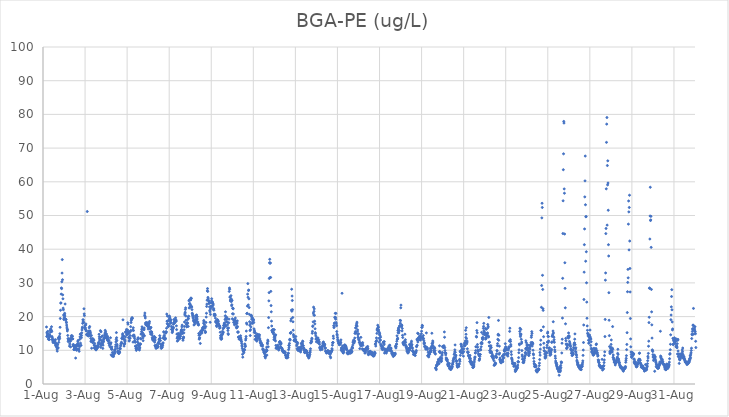
| Category | BGA-PE (ug/L) |
|---|---|
| 44774.166666666664 | 16.92 |
| 44774.177083333336 | 14.11 |
| 44774.1875 | 15.34 |
| 44774.197916666664 | 15.07 |
| 44774.208333333336 | 14.6 |
| 44774.21875 | 14.33 |
| 44774.229166666664 | 15.63 |
| 44774.239583333336 | 14.88 |
| 44774.25 | 13.34 |
| 44774.260416666664 | 14.18 |
| 44774.270833333336 | 13.73 |
| 44774.28125 | 13.21 |
| 44774.291666666664 | 13.82 |
| 44774.302083333336 | 13.18 |
| 44774.3125 | 14.64 |
| 44774.322916666664 | 14.43 |
| 44774.333333333336 | 14.18 |
| 44774.34375 | 15.96 |
| 44774.354166666664 | 15.36 |
| 44774.364583333336 | 16.37 |
| 44774.375 | 15.71 |
| 44774.385416666664 | 15.97 |
| 44774.395833333336 | 15.94 |
| 44774.40625 | 17 |
| 44774.416666666664 | 15.57 |
| 44774.427083333336 | 14.09 |
| 44774.4375 | 13.16 |
| 44774.447916666664 | 13.66 |
| 44774.458333333336 | 13.26 |
| 44774.46875 | 12.71 |
| 44774.479166666664 | 12.29 |
| 44774.489583333336 | 12.75 |
| 44774.5 | 12.56 |
| 44774.510416666664 | 12.51 |
| 44774.520833333336 | 12.77 |
| 44774.53125 | 13.04 |
| 44774.541666666664 | 12.8 |
| 44774.552083333336 | 12.38 |
| 44774.5625 | 12.25 |
| 44774.572916666664 | 12.52 |
| 44774.583333333336 | 11.94 |
| 44774.59375 | 13.15 |
| 44774.604166666664 | 11.35 |
| 44774.614583333336 | 11.45 |
| 44774.625 | 11.86 |
| 44774.635416666664 | 12 |
| 44774.645833333336 | 11.11 |
| 44774.65625 | 10.83 |
| 44774.666666666664 | 10.36 |
| 44774.677083333336 | 9.75 |
| 44774.6875 | 11.79 |
| 44774.697916666664 | 11.64 |
| 44774.708333333336 | 10.62 |
| 44774.71875 | 10.79 |
| 44774.729166666664 | 13.51 |
| 44774.739583333336 | 13.8 |
| 44774.75 | 12.36 |
| 44774.760416666664 | 13.16 |
| 44774.770833333336 | 13.83 |
| 44774.78125 | 14.16 |
| 44774.791666666664 | 13.52 |
| 44774.802083333336 | 14.91 |
| 44774.8125 | 16.83 |
| 44774.822916666664 | 19.44 |
| 44774.833333333336 | 21.88 |
| 44774.84375 | 23.99 |
| 44774.854166666664 | 24.07 |
| 44774.864583333336 | 26.68 |
| 44774.875 | 28.51 |
| 44774.885416666664 | 28.3 |
| 44774.895833333336 | 30.33 |
| 44774.90625 | 32.92 |
| 44774.916666666664 | 36.91 |
| 44774.927083333336 | 30.95 |
| 44774.9375 | 26.45 |
| 44774.947916666664 | 25.28 |
| 44774.958333333336 | 22.51 |
| 44774.96875 | 22.03 |
| 44774.979166666664 | 20.46 |
| 44774.989583333336 | 19.29 |
| 44775.0 | 19.12 |
| 44775.010416666664 | 19.81 |
| 44775.020833333336 | 20.59 |
| 44775.03125 | 20.98 |
| 44775.041666666664 | 20.17 |
| 44775.052083333336 | 23.74 |
| 44775.0625 | 19.3 |
| 44775.072916666664 | 19.22 |
| 44775.083333333336 | 19.19 |
| 44775.09375 | 19.11 |
| 44775.104166666664 | 18.42 |
| 44775.114583333336 | 18.18 |
| 44775.125 | 17.49 |
| 44775.135416666664 | 16.89 |
| 44775.145833333336 | 16.38 |
| 44775.15625 | 15.73 |
| 44775.166666666664 | 16.12 |
| 44775.177083333336 | 14.41 |
| 44775.1875 | 13.46 |
| 44775.197916666664 | 12.59 |
| 44775.208333333336 | 13.03 |
| 44775.21875 | 13.15 |
| 44775.229166666664 | 13.46 |
| 44775.239583333336 | 13.25 |
| 44775.25 | 12.78 |
| 44775.260416666664 | 11.24 |
| 44775.270833333336 | 11.89 |
| 44775.28125 | 13.18 |
| 44775.291666666664 | 12.65 |
| 44775.302083333336 | 12.76 |
| 44775.3125 | 11.02 |
| 44775.322916666664 | 13.22 |
| 44775.333333333336 | 13.66 |
| 44775.34375 | 13.33 |
| 44775.354166666664 | 14.35 |
| 44775.364583333336 | 14.08 |
| 44775.375 | 14.29 |
| 44775.385416666664 | 14.22 |
| 44775.395833333336 | 14.11 |
| 44775.40625 | 13.4 |
| 44775.416666666664 | 13.39 |
| 44775.427083333336 | 11.64 |
| 44775.4375 | 11.31 |
| 44775.447916666664 | 11.7 |
| 44775.458333333336 | 11.24 |
| 44775.46875 | 10.25 |
| 44775.479166666664 | 10.18 |
| 44775.489583333336 | 10.69 |
| 44775.5 | 10.59 |
| 44775.510416666664 | 10.52 |
| 44775.520833333336 | 10.27 |
| 44775.53125 | 11.35 |
| 44775.541666666664 | 11.26 |
| 44775.552083333336 | 7.7 |
| 44775.5625 | 10.57 |
| 44775.572916666664 | 11.12 |
| 44775.583333333336 | 11.51 |
| 44775.59375 | 10.02 |
| 44775.604166666664 | 10.26 |
| 44775.614583333336 | 10.48 |
| 44775.625 | 11.38 |
| 44775.635416666664 | 11.87 |
| 44775.645833333336 | 11.58 |
| 44775.65625 | 12.53 |
| 44775.666666666664 | 12.92 |
| 44775.677083333336 | 11.87 |
| 44775.6875 | 11.37 |
| 44775.697916666664 | 10.15 |
| 44775.708333333336 | 10.4 |
| 44775.71875 | 9.7 |
| 44775.729166666664 | 11.43 |
| 44775.739583333336 | 11.06 |
| 44775.75 | 13.26 |
| 44775.760416666664 | 13.99 |
| 44775.770833333336 | 14.8 |
| 44775.78125 | 12.13 |
| 44775.791666666664 | 14.78 |
| 44775.802083333336 | 13.88 |
| 44775.8125 | 11.47 |
| 44775.822916666664 | 13.72 |
| 44775.833333333336 | 14.38 |
| 44775.84375 | 15.18 |
| 44775.854166666664 | 16.04 |
| 44775.864583333336 | 16.59 |
| 44775.875 | 16.87 |
| 44775.885416666664 | 17.99 |
| 44775.895833333336 | 19.05 |
| 44775.90625 | 18.41 |
| 44775.916666666664 | 19.02 |
| 44775.927083333336 | 18.27 |
| 44775.9375 | 18.24 |
| 44775.947916666664 | 22.32 |
| 44775.958333333336 | 20.81 |
| 44775.96875 | 20.28 |
| 44775.979166666664 | 16.71 |
| 44775.989583333336 | 17.27 |
| 44776.0 | 16.37 |
| 44776.010416666664 | 16.76 |
| 44776.020833333336 | 17.44 |
| 44776.03125 | 16.22 |
| 44776.041666666664 | 17.82 |
| 44776.052083333336 | 15.79 |
| 44776.0625 | 15.76 |
| 44776.072916666664 | 14.7 |
| 44776.083333333336 | 14.71 |
| 44776.09375 | 14.5 |
| 44776.104166666664 | 51.18 |
| 44776.114583333336 | 14.47 |
| 44776.125 | 14.93 |
| 44776.135416666664 | 14.73 |
| 44776.145833333336 | 14.53 |
| 44776.15625 | 14.23 |
| 44776.166666666664 | 15.32 |
| 44776.177083333336 | 15.71 |
| 44776.1875 | 15.62 |
| 44776.197916666664 | 16.68 |
| 44776.208333333336 | 14.77 |
| 44776.21875 | 17.06 |
| 44776.229166666664 | 15.73 |
| 44776.239583333336 | 15.65 |
| 44776.25 | 14.25 |
| 44776.260416666664 | 15.14 |
| 44776.270833333336 | 13.56 |
| 44776.28125 | 12.61 |
| 44776.291666666664 | 12.78 |
| 44776.302083333336 | 14.4 |
| 44776.3125 | 10.61 |
| 44776.322916666664 | 13.12 |
| 44776.333333333336 | 13.19 |
| 44776.34375 | 12.85 |
| 44776.354166666664 | 12.32 |
| 44776.364583333336 | 13.48 |
| 44776.375 | 12.39 |
| 44776.385416666664 | 12.93 |
| 44776.395833333336 | 12.88 |
| 44776.40625 | 13.18 |
| 44776.416666666664 | 12.95 |
| 44776.427083333336 | 11.57 |
| 44776.4375 | 10.69 |
| 44776.447916666664 | 11.45 |
| 44776.458333333336 | 12.03 |
| 44776.46875 | 10.72 |
| 44776.479166666664 | 11.21 |
| 44776.489583333336 | 10.38 |
| 44776.5 | 10.76 |
| 44776.510416666664 | 10.65 |
| 44776.520833333336 | 10.11 |
| 44776.53125 | 10.23 |
| 44776.541666666664 | 11.05 |
| 44776.552083333336 | 10.57 |
| 44776.5625 | 10.5 |
| 44776.572916666664 | 10.97 |
| 44776.583333333336 | 11.18 |
| 44776.59375 | 10.75 |
| 44776.604166666664 | 11.52 |
| 44776.614583333336 | 11.17 |
| 44776.625 | 11.19 |
| 44776.635416666664 | 12.31 |
| 44776.645833333336 | 12.11 |
| 44776.65625 | 12.01 |
| 44776.666666666664 | 14.75 |
| 44776.677083333336 | 14.02 |
| 44776.6875 | 13.46 |
| 44776.697916666664 | 12.87 |
| 44776.708333333336 | 13.14 |
| 44776.71875 | 11.74 |
| 44776.729166666664 | 15.83 |
| 44776.739583333336 | 10.89 |
| 44776.75 | 11.91 |
| 44776.760416666664 | 15.49 |
| 44776.770833333336 | 13.95 |
| 44776.78125 | 11.48 |
| 44776.791666666664 | 12.26 |
| 44776.802083333336 | 12.93 |
| 44776.8125 | 12.42 |
| 44776.822916666664 | 14.26 |
| 44776.833333333336 | 11.95 |
| 44776.84375 | 10.57 |
| 44776.854166666664 | 11.52 |
| 44776.864583333336 | 12.52 |
| 44776.875 | 12.55 |
| 44776.885416666664 | 13.1 |
| 44776.895833333336 | 13.56 |
| 44776.90625 | 13.56 |
| 44776.916666666664 | 13.58 |
| 44776.927083333336 | 14.25 |
| 44776.9375 | 14.76 |
| 44776.947916666664 | 15.13 |
| 44776.958333333336 | 15.93 |
| 44776.96875 | 14.37 |
| 44776.979166666664 | 15.48 |
| 44776.989583333336 | 13.82 |
| 44777.0 | 13.84 |
| 44777.010416666664 | 13.98 |
| 44777.020833333336 | 14.82 |
| 44777.03125 | 13.79 |
| 44777.041666666664 | 13.5 |
| 44777.052083333336 | 13.09 |
| 44777.0625 | 14.19 |
| 44777.072916666664 | 13.95 |
| 44777.083333333336 | 12.89 |
| 44777.09375 | 13.41 |
| 44777.104166666664 | 12.73 |
| 44777.114583333336 | 12.87 |
| 44777.125 | 12.12 |
| 44777.135416666664 | 12.93 |
| 44777.145833333336 | 12.16 |
| 44777.15625 | 11.45 |
| 44777.166666666664 | 11.95 |
| 44777.177083333336 | 11.95 |
| 44777.1875 | 11.01 |
| 44777.197916666664 | 12.07 |
| 44777.208333333336 | 13.73 |
| 44777.21875 | 11.92 |
| 44777.229166666664 | 12.25 |
| 44777.239583333336 | 8.65 |
| 44777.25 | 10.63 |
| 44777.260416666664 | 10.32 |
| 44777.270833333336 | 11.01 |
| 44777.28125 | 10.3 |
| 44777.291666666664 | 8.26 |
| 44777.302083333336 | 9.36 |
| 44777.3125 | 8.37 |
| 44777.322916666664 | 8.65 |
| 44777.333333333336 | 9.2 |
| 44777.34375 | 8.43 |
| 44777.354166666664 | 8.16 |
| 44777.364583333336 | 9.07 |
| 44777.375 | 8.81 |
| 44777.385416666664 | 9.17 |
| 44777.395833333336 | 9.43 |
| 44777.40625 | 10.06 |
| 44777.416666666664 | 9.87 |
| 44777.427083333336 | 9.24 |
| 44777.4375 | 10.29 |
| 44777.447916666664 | 11.01 |
| 44777.458333333336 | 11.62 |
| 44777.46875 | 12.49 |
| 44777.479166666664 | 13.27 |
| 44777.489583333336 | 15.25 |
| 44777.5 | 13.74 |
| 44777.510416666664 | 12.87 |
| 44777.520833333336 | 11.75 |
| 44777.53125 | 11.27 |
| 44777.541666666664 | 10.59 |
| 44777.552083333336 | 9.66 |
| 44777.5625 | 9.32 |
| 44777.572916666664 | 9.66 |
| 44777.583333333336 | 9.69 |
| 44777.59375 | 9.12 |
| 44777.604166666664 | 9.05 |
| 44777.614583333336 | 9.1 |
| 44777.625 | 9.35 |
| 44777.635416666664 | 9.57 |
| 44777.645833333336 | 9.43 |
| 44777.65625 | 10.36 |
| 44777.666666666664 | 10.68 |
| 44777.677083333336 | 10.47 |
| 44777.6875 | 11.28 |
| 44777.697916666664 | 11.55 |
| 44777.708333333336 | 11.93 |
| 44777.71875 | 11.95 |
| 44777.729166666664 | 12.4 |
| 44777.739583333336 | 12.08 |
| 44777.75 | 13.54 |
| 44777.760416666664 | 13.49 |
| 44777.770833333336 | 13.85 |
| 44777.78125 | 14.56 |
| 44777.791666666664 | 14.94 |
| 44777.802083333336 | 19.04 |
| 44777.8125 | 14.12 |
| 44777.822916666664 | 13.29 |
| 44777.833333333336 | 14.26 |
| 44777.84375 | 13.39 |
| 44777.854166666664 | 11.25 |
| 44777.864583333336 | 11.81 |
| 44777.875 | 11.88 |
| 44777.885416666664 | 12.12 |
| 44777.895833333336 | 12.62 |
| 44777.90625 | 13.03 |
| 44777.916666666664 | 13.94 |
| 44777.927083333336 | 15.31 |
| 44777.9375 | 15.5 |
| 44777.947916666664 | 15.54 |
| 44777.958333333336 | 15.58 |
| 44777.96875 | 16.19 |
| 44777.979166666664 | 14.57 |
| 44777.989583333336 | 14.67 |
| 44778.0 | 15.19 |
| 44778.010416666664 | 15.66 |
| 44778.020833333336 | 16.06 |
| 44778.03125 | 18.18 |
| 44778.041666666664 | 17.75 |
| 44778.052083333336 | 15.47 |
| 44778.0625 | 14.9 |
| 44778.072916666664 | 13.77 |
| 44778.083333333336 | 13.84 |
| 44778.09375 | 12.73 |
| 44778.104166666664 | 12.95 |
| 44778.114583333336 | 13.61 |
| 44778.125 | 15.28 |
| 44778.135416666664 | 14.39 |
| 44778.145833333336 | 13.6 |
| 44778.15625 | 15.71 |
| 44778.166666666664 | 17.02 |
| 44778.177083333336 | 15.86 |
| 44778.1875 | 18.23 |
| 44778.197916666664 | 18.84 |
| 44778.208333333336 | 19.19 |
| 44778.21875 | 19.52 |
| 44778.229166666664 | 19.39 |
| 44778.239583333336 | 19.7 |
| 44778.25 | 19.45 |
| 44778.260416666664 | 14.28 |
| 44778.270833333336 | 16 |
| 44778.28125 | 12.43 |
| 44778.291666666664 | 16.68 |
| 44778.302083333336 | 15.87 |
| 44778.3125 | 14.38 |
| 44778.322916666664 | 14.56 |
| 44778.333333333336 | 14.24 |
| 44778.34375 | 14 |
| 44778.354166666664 | 13.53 |
| 44778.364583333336 | 12.93 |
| 44778.375 | 12.49 |
| 44778.385416666664 | 12.39 |
| 44778.395833333336 | 11.23 |
| 44778.40625 | 11.16 |
| 44778.416666666664 | 10.52 |
| 44778.427083333336 | 10.98 |
| 44778.4375 | 9.97 |
| 44778.447916666664 | 10.36 |
| 44778.458333333336 | 10.76 |
| 44778.46875 | 10.54 |
| 44778.479166666664 | 11.53 |
| 44778.489583333336 | 12.47 |
| 44778.5 | 13.23 |
| 44778.510416666664 | 13.3 |
| 44778.520833333336 | 13.72 |
| 44778.53125 | 13.57 |
| 44778.541666666664 | 12.11 |
| 44778.552083333336 | 11.55 |
| 44778.5625 | 11.21 |
| 44778.572916666664 | 10.35 |
| 44778.583333333336 | 10.07 |
| 44778.59375 | 10.86 |
| 44778.604166666664 | 10.69 |
| 44778.614583333336 | 11.65 |
| 44778.625 | 11.78 |
| 44778.635416666664 | 11.92 |
| 44778.645833333336 | 13.49 |
| 44778.65625 | 13.39 |
| 44778.666666666664 | 14.75 |
| 44778.677083333336 | 14.95 |
| 44778.6875 | 15.55 |
| 44778.697916666664 | 16.14 |
| 44778.708333333336 | 16.97 |
| 44778.71875 | 16.45 |
| 44778.729166666664 | 15.23 |
| 44778.739583333336 | 14.18 |
| 44778.75 | 13.65 |
| 44778.760416666664 | 12.86 |
| 44778.770833333336 | 14.33 |
| 44778.78125 | 14.75 |
| 44778.791666666664 | 16.29 |
| 44778.802083333336 | 16.1 |
| 44778.8125 | 16.62 |
| 44778.822916666664 | 14.3 |
| 44778.833333333336 | 20.41 |
| 44778.84375 | 21.06 |
| 44778.854166666664 | 20.04 |
| 44778.864583333336 | 19.59 |
| 44778.875 | 18.05 |
| 44778.885416666664 | 17.61 |
| 44778.895833333336 | 18.19 |
| 44778.90625 | 17.56 |
| 44778.916666666664 | 17.68 |
| 44778.927083333336 | 18.2 |
| 44778.9375 | 17.35 |
| 44778.947916666664 | 17.78 |
| 44778.958333333336 | 17.65 |
| 44778.96875 | 18.13 |
| 44778.979166666664 | 17.97 |
| 44778.989583333336 | 17.01 |
| 44779.0 | 16.32 |
| 44779.010416666664 | 17.02 |
| 44779.020833333336 | 17.23 |
| 44779.03125 | 17.09 |
| 44779.041666666664 | 17.83 |
| 44779.052083333336 | 18.11 |
| 44779.0625 | 18.54 |
| 44779.072916666664 | 16.46 |
| 44779.083333333336 | 16.7 |
| 44779.09375 | 15.49 |
| 44779.104166666664 | 16.46 |
| 44779.114583333336 | 14.82 |
| 44779.125 | 15.44 |
| 44779.135416666664 | 16.81 |
| 44779.145833333336 | 15.46 |
| 44779.15625 | 15.4 |
| 44779.166666666664 | 15.47 |
| 44779.177083333336 | 15.05 |
| 44779.1875 | 14.51 |
| 44779.197916666664 | 13.78 |
| 44779.208333333336 | 13.47 |
| 44779.21875 | 13.13 |
| 44779.229166666664 | 13.04 |
| 44779.239583333336 | 13.2 |
| 44779.25 | 12.9 |
| 44779.260416666664 | 13.25 |
| 44779.270833333336 | 13.4 |
| 44779.28125 | 13.92 |
| 44779.291666666664 | 14.11 |
| 44779.302083333336 | 13.07 |
| 44779.3125 | 12.41 |
| 44779.322916666664 | 11.41 |
| 44779.333333333336 | 13.03 |
| 44779.34375 | 13.75 |
| 44779.354166666664 | 11.03 |
| 44779.364583333336 | 11.08 |
| 44779.375 | 10.56 |
| 44779.385416666664 | 10.82 |
| 44779.395833333336 | 11.6 |
| 44779.40625 | 11.23 |
| 44779.416666666664 | 11.25 |
| 44779.427083333336 | 10.91 |
| 44779.4375 | 10.86 |
| 44779.447916666664 | 10.82 |
| 44779.458333333336 | 11.16 |
| 44779.46875 | 11.14 |
| 44779.479166666664 | 12.07 |
| 44779.489583333336 | 12.07 |
| 44779.5 | 12.2 |
| 44779.510416666664 | 12.66 |
| 44779.520833333336 | 13.25 |
| 44779.53125 | 13.29 |
| 44779.541666666664 | 13.45 |
| 44779.552083333336 | 14.33 |
| 44779.5625 | 13.59 |
| 44779.572916666664 | 13.58 |
| 44779.583333333336 | 12.87 |
| 44779.59375 | 11.83 |
| 44779.604166666664 | 11.74 |
| 44779.614583333336 | 10.95 |
| 44779.625 | 10.56 |
| 44779.635416666664 | 11.36 |
| 44779.645833333336 | 11.18 |
| 44779.65625 | 10.97 |
| 44779.666666666664 | 10.82 |
| 44779.677083333336 | 11.58 |
| 44779.6875 | 11.38 |
| 44779.697916666664 | 12.03 |
| 44779.708333333336 | 12.24 |
| 44779.71875 | 13.56 |
| 44779.729166666664 | 13.85 |
| 44779.739583333336 | 15.52 |
| 44779.75 | 15.33 |
| 44779.760416666664 | 14.41 |
| 44779.770833333336 | 14.22 |
| 44779.78125 | 13.28 |
| 44779.791666666664 | 13.43 |
| 44779.802083333336 | 13.27 |
| 44779.8125 | 13.6 |
| 44779.822916666664 | 13.47 |
| 44779.833333333336 | 15.05 |
| 44779.84375 | 15.47 |
| 44779.854166666664 | 15.49 |
| 44779.864583333336 | 15.4 |
| 44779.875 | 16.55 |
| 44779.885416666664 | 20.75 |
| 44779.895833333336 | 18.63 |
| 44779.90625 | 17.88 |
| 44779.916666666664 | 20.14 |
| 44779.927083333336 | 18.69 |
| 44779.9375 | 17.85 |
| 44779.947916666664 | 17.1 |
| 44779.958333333336 | 17.1 |
| 44779.96875 | 17.16 |
| 44779.979166666664 | 17.49 |
| 44779.989583333336 | 18.78 |
| 44780.0 | 19.25 |
| 44780.010416666664 | 20.18 |
| 44780.020833333336 | 19.84 |
| 44780.03125 | 19.61 |
| 44780.041666666664 | 19.17 |
| 44780.052083333336 | 18.81 |
| 44780.0625 | 18.03 |
| 44780.072916666664 | 18.13 |
| 44780.083333333336 | 18.28 |
| 44780.09375 | 19.03 |
| 44780.104166666664 | 17.13 |
| 44780.114583333336 | 16.23 |
| 44780.125 | 16.14 |
| 44780.135416666664 | 16.77 |
| 44780.145833333336 | 15.25 |
| 44780.15625 | 15.58 |
| 44780.166666666664 | 16.03 |
| 44780.177083333336 | 16.77 |
| 44780.1875 | 16.43 |
| 44780.197916666664 | 17.74 |
| 44780.208333333336 | 16.76 |
| 44780.21875 | 18.17 |
| 44780.229166666664 | 19.16 |
| 44780.239583333336 | 18.31 |
| 44780.25 | 18.01 |
| 44780.260416666664 | 18.73 |
| 44780.270833333336 | 18.6 |
| 44780.28125 | 18.39 |
| 44780.291666666664 | 18.66 |
| 44780.302083333336 | 19.63 |
| 44780.3125 | 19.07 |
| 44780.322916666664 | 18.9 |
| 44780.333333333336 | 18.63 |
| 44780.34375 | 17.25 |
| 44780.354166666664 | 16.14 |
| 44780.364583333336 | 14.81 |
| 44780.375 | 13.59 |
| 44780.385416666664 | 12.72 |
| 44780.395833333336 | 13.96 |
| 44780.40625 | 14.81 |
| 44780.416666666664 | 14.89 |
| 44780.427083333336 | 13 |
| 44780.4375 | 14.64 |
| 44780.447916666664 | 14.08 |
| 44780.458333333336 | 14.98 |
| 44780.46875 | 14.03 |
| 44780.479166666664 | 13.69 |
| 44780.489583333336 | 13.62 |
| 44780.5 | 13.9 |
| 44780.510416666664 | 13.5 |
| 44780.520833333336 | 14.16 |
| 44780.53125 | 14.16 |
| 44780.541666666664 | 14.63 |
| 44780.552083333336 | 15.16 |
| 44780.5625 | 15.62 |
| 44780.572916666664 | 15.77 |
| 44780.583333333336 | 16.01 |
| 44780.59375 | 16.16 |
| 44780.604166666664 | 16.96 |
| 44780.614583333336 | 17.47 |
| 44780.625 | 15.53 |
| 44780.635416666664 | 14.98 |
| 44780.645833333336 | 13.5 |
| 44780.65625 | 12.97 |
| 44780.666666666664 | 13.44 |
| 44780.677083333336 | 13.88 |
| 44780.6875 | 13.9 |
| 44780.697916666664 | 15.17 |
| 44780.708333333336 | 16.09 |
| 44780.71875 | 17.08 |
| 44780.729166666664 | 18.4 |
| 44780.739583333336 | 20.51 |
| 44780.75 | 20.98 |
| 44780.760416666664 | 21.3 |
| 44780.770833333336 | 22.11 |
| 44780.78125 | 22.59 |
| 44780.791666666664 | 20.19 |
| 44780.802083333336 | 18.93 |
| 44780.8125 | 17.93 |
| 44780.822916666664 | 17.57 |
| 44780.833333333336 | 16.96 |
| 44780.84375 | 17.02 |
| 44780.854166666664 | 18.16 |
| 44780.864583333336 | 18.13 |
| 44780.875 | 17.98 |
| 44780.885416666664 | 19.16 |
| 44780.895833333336 | 19.91 |
| 44780.90625 | 17.1 |
| 44780.916666666664 | 19.47 |
| 44780.927083333336 | 20.13 |
| 44780.9375 | 24.69 |
| 44780.947916666664 | 22.55 |
| 44780.958333333336 | 23.72 |
| 44780.96875 | 25.01 |
| 44780.979166666664 | 23.91 |
| 44780.989583333336 | 23.13 |
| 44781.0 | 22.75 |
| 44781.010416666664 | 23.46 |
| 44781.020833333336 | 24.92 |
| 44781.03125 | 25.5 |
| 44781.041666666664 | 25.28 |
| 44781.052083333336 | 25.42 |
| 44781.0625 | 23.02 |
| 44781.072916666664 | 22.83 |
| 44781.083333333336 | 22.07 |
| 44781.09375 | 21.01 |
| 44781.104166666664 | 20.8 |
| 44781.114583333336 | 20.22 |
| 44781.125 | 20.47 |
| 44781.135416666664 | 19.8 |
| 44781.145833333336 | 19.47 |
| 44781.15625 | 18.95 |
| 44781.166666666664 | 18.57 |
| 44781.177083333336 | 17.51 |
| 44781.1875 | 18.77 |
| 44781.197916666664 | 18.85 |
| 44781.208333333336 | 17.73 |
| 44781.21875 | 18.17 |
| 44781.229166666664 | 18.72 |
| 44781.239583333336 | 18.45 |
| 44781.25 | 20.16 |
| 44781.260416666664 | 19.66 |
| 44781.270833333336 | 19.08 |
| 44781.28125 | 20.19 |
| 44781.291666666664 | 18.88 |
| 44781.302083333336 | 20.5 |
| 44781.3125 | 19.43 |
| 44781.322916666664 | 19.2 |
| 44781.333333333336 | 19.98 |
| 44781.34375 | 18.2 |
| 44781.354166666664 | 17.97 |
| 44781.364583333336 | 18.4 |
| 44781.375 | 17.64 |
| 44781.385416666664 | 17.82 |
| 44781.395833333336 | 17.48 |
| 44781.40625 | 14.99 |
| 44781.416666666664 | 14.44 |
| 44781.427083333336 | 13.3 |
| 44781.4375 | 13.54 |
| 44781.447916666664 | 13.74 |
| 44781.458333333336 | 14.57 |
| 44781.46875 | 14.62 |
| 44781.479166666664 | 12.04 |
| 44781.489583333336 | 15.6 |
| 44781.5 | 15.24 |
| 44781.510416666664 | 15.56 |
| 44781.520833333336 | 15.58 |
| 44781.53125 | 15.72 |
| 44781.541666666664 | 15.35 |
| 44781.55210648148 | 15.08 |
| 44781.5625 | 16.1 |
| 44781.572916666664 | 15.89 |
| 44781.583333333336 | 16.59 |
| 44781.59375 | 15.97 |
| 44781.604166666664 | 16.67 |
| 44781.614583333336 | 16.38 |
| 44781.625 | 16.95 |
| 44781.635416666664 | 18.05 |
| 44781.645833333336 | 18.86 |
| 44781.65625 | 18.55 |
| 44781.666666666664 | 16.75 |
| 44781.677083333336 | 17.58 |
| 44781.6875 | 16.81 |
| 44781.697916666664 | 16.54 |
| 44781.708333333336 | 15.68 |
| 44781.71875 | 15.26 |
| 44781.729166666664 | 15.43 |
| 44781.739583333336 | 17.04 |
| 44781.75 | 18.27 |
| 44781.760416666664 | 19.87 |
| 44781.770833333336 | 20.98 |
| 44781.78125 | 23.01 |
| 44781.791666666664 | 23.7 |
| 44781.802083333336 | 24.87 |
| 44781.8125 | 27.63 |
| 44781.822916666664 | 28.31 |
| 44781.833333333336 | 27.48 |
| 44781.84375 | 25.7 |
| 44781.854166666664 | 25.29 |
| 44781.864583333336 | 24.78 |
| 44781.875 | 24.76 |
| 44781.885416666664 | 23.86 |
| 44781.895833333336 | 24.36 |
| 44781.90625 | 24.07 |
| 44781.916666666664 | 22.89 |
| 44781.927083333336 | 21.85 |
| 44781.9375 | 21.41 |
| 44781.947916666664 | 18.31 |
| 44781.958333333336 | 20.65 |
| 44781.96875 | 22.33 |
| 44781.979166666664 | 23.08 |
| 44781.989583333336 | 24.09 |
| 44782.0 | 23.03 |
| 44782.010416666664 | 24.66 |
| 44782.020833333336 | 25.3 |
| 44782.03125 | 24.1 |
| 44782.041666666664 | 22.9 |
| 44782.052083333336 | 23.2 |
| 44782.0625 | 24.33 |
| 44782.072916666664 | 23.99 |
| 44782.083333333336 | 23.34 |
| 44782.09375 | 23.71 |
| 44782.104166666664 | 22.09 |
| 44782.114583333336 | 22.38 |
| 44782.125 | 21.9 |
| 44782.135416666664 | 20.72 |
| 44782.145833333336 | 20.37 |
| 44782.15625 | 20.28 |
| 44782.166666666664 | 20.41 |
| 44782.177083333336 | 20.7 |
| 44782.1875 | 20.41 |
| 44782.197916666664 | 19.55 |
| 44782.208333333336 | 18.45 |
| 44782.21875 | 18.37 |
| 44782.229166666664 | 18.8 |
| 44782.239583333336 | 18.43 |
| 44782.25 | 17.34 |
| 44782.260416666664 | 17.04 |
| 44782.270833333336 | 17.97 |
| 44782.28125 | 17.47 |
| 44782.291666666664 | 19.09 |
| 44782.302083333336 | 19 |
| 44782.3125 | 18.46 |
| 44782.322916666664 | 18.83 |
| 44782.333333333336 | 18.48 |
| 44782.34375 | 17.42 |
| 44782.354166666664 | 17.84 |
| 44782.364583333336 | 17.49 |
| 44782.375 | 17.35 |
| 44782.385416666664 | 17.14 |
| 44782.395833333336 | 16.55 |
| 44782.40625 | 17.17 |
| 44782.416666666664 | 16.79 |
| 44782.427083333336 | 15.35 |
| 44782.4375 | 13.67 |
| 44782.447916666664 | 14.36 |
| 44782.458333333336 | 14.33 |
| 44782.46875 | 13.26 |
| 44782.479166666664 | 14.05 |
| 44782.489583333336 | 13.35 |
| 44782.5 | 13.61 |
| 44782.510416666664 | 14.59 |
| 44782.520833333336 | 14.62 |
| 44782.53125 | 15.61 |
| 44782.541666666664 | 14.95 |
| 44782.552083333336 | 15.17 |
| 44782.5625 | 16.39 |
| 44782.572916666664 | 15.39 |
| 44782.583333333336 | 17.35 |
| 44782.59375 | 16.64 |
| 44782.604166666664 | 16.81 |
| 44782.614583333336 | 17.83 |
| 44782.625 | 18.11 |
| 44782.635416666664 | 17.49 |
| 44782.645833333336 | 17.63 |
| 44782.65625 | 19.12 |
| 44782.666666666664 | 20.24 |
| 44782.677083333336 | 21.42 |
| 44782.6875 | 19.56 |
| 44782.697916666664 | 17.12 |
| 44782.708333333336 | 18.46 |
| 44782.71875 | 19.64 |
| 44782.729166666664 | 19.79 |
| 44782.739583333336 | 19.15 |
| 44782.75 | 19.58 |
| 44782.760416666664 | 18.31 |
| 44782.770833333336 | 17.54 |
| 44782.78125 | 16.53 |
| 44782.791666666664 | 15.87 |
| 44782.802083333336 | 14.96 |
| 44782.8125 | 14.7 |
| 44782.822916666664 | 16.63 |
| 44782.833333333336 | 18.18 |
| 44782.84375 | 19.24 |
| 44782.854166666664 | 27.47 |
| 44782.864583333336 | 28.48 |
| 44782.875 | 28.1 |
| 44782.885416666664 | 25.8 |
| 44782.895833333336 | 25.78 |
| 44782.90625 | 24.65 |
| 44782.916666666664 | 25.03 |
| 44782.927083333336 | 24.78 |
| 44782.9375 | 26.21 |
| 44782.947916666664 | 25.24 |
| 44782.958333333336 | 24.46 |
| 44782.96875 | 23.22 |
| 44782.979166666664 | 23.52 |
| 44782.989583333336 | 24.82 |
| 44783.0 | 19.35 |
| 44783.010416666664 | 20.84 |
| 44783.020833333336 | 22.44 |
| 44783.03125 | 22.5 |
| 44783.041666666664 | 22.31 |
| 44783.052083333336 | 20.78 |
| 44783.0625 | 18.27 |
| 44783.072916666664 | 19.07 |
| 44783.083333333336 | 18.83 |
| 44783.09375 | 18.77 |
| 44783.104166666664 | 17.56 |
| 44783.114583333336 | 18.47 |
| 44783.125 | 17.8 |
| 44783.135416666664 | 18.95 |
| 44783.145833333336 | 19.58 |
| 44783.15625 | 18.76 |
| 44783.166666666664 | 18.37 |
| 44783.177083333336 | 17.78 |
| 44783.1875 | 17.86 |
| 44783.197916666664 | 16.67 |
| 44783.208333333336 | 17.01 |
| 44783.21875 | 16.69 |
| 44783.229166666664 | 18.08 |
| 44783.239583333336 | 18.72 |
| 44783.25 | 17.03 |
| 44783.260416666664 | 15.44 |
| 44783.270833333336 | 15.33 |
| 44783.28125 | 15.45 |
| 44783.291666666664 | 13.91 |
| 44783.302083333336 | 13.83 |
| 44783.3125 | 13.98 |
| 44783.322916666664 | 13.33 |
| 44783.333333333336 | 13.94 |
| 44783.34375 | 13.29 |
| 44783.354166666664 | 13.37 |
| 44783.364583333336 | 13.62 |
| 44783.375 | 13.83 |
| 44783.385416666664 | 13.38 |
| 44783.395833333336 | 14.31 |
| 44783.40625 | 13.65 |
| 44783.416666666664 | 13.21 |
| 44783.427083333336 | 12.76 |
| 44783.4375 | 12.56 |
| 44783.447916666664 | 12.04 |
| 44783.458333333336 | 11.48 |
| 44783.46875 | 11.07 |
| 44783.479166666664 | 10.49 |
| 44783.489583333336 | 8.82 |
| 44783.5 | 7.96 |
| 44783.510416666664 | 9.89 |
| 44783.520833333336 | 10.06 |
| 44783.53125 | 9.69 |
| 44783.541666666664 | 9.96 |
| 44783.552083333336 | 9.29 |
| 44783.5625 | 9.91 |
| 44783.572916666664 | 10.16 |
| 44783.583333333336 | 10.23 |
| 44783.59375 | 11.83 |
| 44783.604166666664 | 11.83 |
| 44783.614583333336 | 11.07 |
| 44783.625 | 11.29 |
| 44783.635416666664 | 13.04 |
| 44783.645833333336 | 13.49 |
| 44783.65625 | 14.09 |
| 44783.666666666664 | 15.71 |
| 44783.677083333336 | 18.08 |
| 44783.6875 | 20.88 |
| 44783.697916666664 | 17.74 |
| 44783.708333333336 | 20.99 |
| 44783.71875 | 23.11 |
| 44783.729166666664 | 26.66 |
| 44783.739583333336 | 29.79 |
| 44783.75 | 25.74 |
| 44783.760416666664 | 23.46 |
| 44783.770833333336 | 27.73 |
| 44783.78125 | 27.89 |
| 44783.791666666664 | 25.27 |
| 44783.802083333336 | 22.68 |
| 44783.8125 | 20.66 |
| 44783.822916666664 | 18.48 |
| 44783.833333333336 | 17.41 |
| 44783.84375 | 15.86 |
| 44783.854166666664 | 14.37 |
| 44783.864583333336 | 16.13 |
| 44783.875 | 17.9 |
| 44783.885416666664 | 16.92 |
| 44783.895833333336 | 20.34 |
| 44783.90625 | 20.38 |
| 44783.916666666664 | 20 |
| 44783.927083333336 | 19.18 |
| 44783.9375 | 19.51 |
| 44783.947916666664 | 19.66 |
| 44783.958333333336 | 18.21 |
| 44783.96875 | 18 |
| 44783.979166666664 | 18.46 |
| 44783.989583333336 | 19.29 |
| 44784.0 | 19.07 |
| 44784.010416666664 | 18.98 |
| 44784.020833333336 | 18.24 |
| 44784.03125 | 16.37 |
| 44784.041666666664 | 15.37 |
| 44784.052083333336 | 15.94 |
| 44784.0625 | 15.28 |
| 44784.072916666664 | 15.36 |
| 44784.083333333336 | 13.24 |
| 44784.09375 | 15.17 |
| 44784.104166666664 | 14.28 |
| 44784.114583333336 | 14.17 |
| 44784.125 | 14.09 |
| 44784.135416666664 | 13.08 |
| 44784.145833333336 | 13.43 |
| 44784.15625 | 12.99 |
| 44784.166666666664 | 12.71 |
| 44784.177083333336 | 13.62 |
| 44784.1875 | 14.74 |
| 44784.197916666664 | 14.67 |
| 44784.208333333336 | 14.72 |
| 44784.21875 | 14.2 |
| 44784.229166666664 | 13.49 |
| 44784.239583333336 | 14.48 |
| 44784.25 | 13.94 |
| 44784.260416666664 | 13.92 |
| 44784.270833333336 | 13.99 |
| 44784.28125 | 14.27 |
| 44784.291666666664 | 14.61 |
| 44784.302083333336 | 13.49 |
| 44784.3125 | 12.96 |
| 44784.322916666664 | 12.98 |
| 44784.333333333336 | 12.35 |
| 44784.34375 | 12.21 |
| 44784.354166666664 | 11.99 |
| 44784.364583333336 | 11.56 |
| 44784.375 | 12.33 |
| 44784.385416666664 | 11.34 |
| 44784.395833333336 | 11.55 |
| 44784.40625 | 11.75 |
| 44784.416666666664 | 11.35 |
| 44784.427083333336 | 11.68 |
| 44784.4375 | 11.26 |
| 44784.447916666664 | 10.34 |
| 44784.458333333336 | 10.4 |
| 44784.46875 | 10.33 |
| 44784.479166666664 | 9.96 |
| 44784.489583333336 | 10.02 |
| 44784.5 | 9.52 |
| 44784.510416666664 | 9.36 |
| 44784.520833333336 | 9.26 |
| 44784.53125 | 9.36 |
| 44784.541666666664 | 8.91 |
| 44784.552083333336 | 8.17 |
| 44784.5625 | 8.08 |
| 44784.572916666664 | 7.74 |
| 44784.583333333336 | 8.31 |
| 44784.59375 | 8.31 |
| 44784.604166666664 | 9.66 |
| 44784.614583333336 | 9.63 |
| 44784.625 | 10.25 |
| 44784.635416666664 | 10.94 |
| 44784.645833333336 | 8.58 |
| 44784.65625 | 9.93 |
| 44784.666666666664 | 12.19 |
| 44784.677083333336 | 11.92 |
| 44784.6875 | 13.02 |
| 44784.697916666664 | 12.69 |
| 44784.708333333336 | 11.04 |
| 44784.71875 | 16.71 |
| 44784.729166666664 | 19.71 |
| 44784.739583333336 | 24.67 |
| 44784.75 | 27.11 |
| 44784.760416666664 | 31.32 |
| 44784.770833333336 | 36 |
| 44784.78125 | 37 |
| 44784.791666666664 | 35.83 |
| 44784.802083333336 | 31.61 |
| 44784.8125 | 35.93 |
| 44784.822916666664 | 31.61 |
| 44784.833333333336 | 27.49 |
| 44784.84375 | 23.27 |
| 44784.854166666664 | 21.42 |
| 44784.864583333336 | 18.65 |
| 44784.875 | 17.21 |
| 44784.885416666664 | 15.93 |
| 44784.895833333336 | 15.81 |
| 44784.90625 | 15.54 |
| 44784.916666666664 | 15.29 |
| 44784.927083333336 | 15.49 |
| 44784.9375 | 16.22 |
| 44784.947916666664 | 15.37 |
| 44784.958333333336 | 15.19 |
| 44784.96875 | 14.75 |
| 44784.979166666664 | 13.17 |
| 44784.989583333336 | 13.88 |
| 44785.0 | 16.11 |
| 44785.010416666664 | 14.2 |
| 44785.020833333336 | 13.27 |
| 44785.03125 | 13.66 |
| 44785.041666666664 | 14.28 |
| 44785.052083333336 | 12.78 |
| 44785.0625 | 14.6 |
| 44785.072916666664 | 11.45 |
| 44785.083333333336 | 10.59 |
| 44785.09375 | 10.76 |
| 44785.104166666664 | 10.66 |
| 44785.114583333336 | 10.71 |
| 44785.125 | 10.85 |
| 44785.135416666664 | 10.85 |
| 44785.145833333336 | 11.27 |
| 44785.15625 | 11.49 |
| 44785.166666666664 | 10.49 |
| 44785.177083333336 | 10.84 |
| 44785.1875 | 10.82 |
| 44785.197916666664 | 10.7 |
| 44785.208333333336 | 10.06 |
| 44785.21875 | 10.65 |
| 44785.229166666664 | 10.42 |
| 44785.239583333336 | 12.41 |
| 44785.25 | 11.85 |
| 44785.260416666664 | 12.6 |
| 44785.270833333336 | 12.5 |
| 44785.28125 | 12.21 |
| 44785.291666666664 | 11.14 |
| 44785.302083333336 | 11.85 |
| 44785.3125 | 11.86 |
| 44785.322916666664 | 12.13 |
| 44785.333333333336 | 10.68 |
| 44785.34375 | 10.69 |
| 44785.354166666664 | 10.65 |
| 44785.364583333336 | 10.53 |
| 44785.375 | 10.01 |
| 44785.385416666664 | 10.23 |
| 44785.395833333336 | 9.79 |
| 44785.40625 | 9.73 |
| 44785.416666666664 | 9.57 |
| 44785.427083333336 | 9.39 |
| 44785.4375 | 9.4 |
| 44785.447916666664 | 9.67 |
| 44785.458333333336 | 9.47 |
| 44785.46875 | 9.57 |
| 44785.479166666664 | 9.3 |
| 44785.489583333336 | 9.6 |
| 44785.5 | 9.47 |
| 44785.510416666664 | 9.44 |
| 44785.520833333336 | 9.25 |
| 44785.53125 | 8.62 |
| 44785.541666666664 | 8.49 |
| 44785.552083333336 | 8.26 |
| 44785.5625 | 7.83 |
| 44785.572916666664 | 7.78 |
| 44785.583333333336 | 8.2 |
| 44785.59375 | 7.81 |
| 44785.604166666664 | 8.19 |
| 44785.614583333336 | 7.78 |
| 44785.625 | 8.36 |
| 44785.635416666664 | 8.49 |
| 44785.645833333336 | 7.91 |
| 44785.65625 | 8.99 |
| 44785.666666666664 | 9.18 |
| 44785.677083333336 | 10.2 |
| 44785.6875 | 11.47 |
| 44785.697916666664 | 10.74 |
| 44785.708333333336 | 11.4 |
| 44785.71875 | 12.05 |
| 44785.729166666664 | 13.25 |
| 44785.739583333336 | 12.98 |
| 44785.75 | 13.21 |
| 44785.760416666664 | 15.07 |
| 44785.770833333336 | 15.18 |
| 44785.78125 | 18.74 |
| 44785.791666666664 | 15.29 |
| 44785.802083333336 | 19.33 |
| 44785.8125 | 21.94 |
| 44785.822916666664 | 28.12 |
| 44785.833333333336 | 21.6 |
| 44785.84375 | 26.1 |
| 44785.854166666664 | 24.77 |
| 44785.864583333336 | 22.06 |
| 44785.875 | 19.73 |
| 44785.885416666664 | 18.46 |
| 44785.895833333336 | 15.96 |
| 44785.90625 | 14.68 |
| 44785.916666666664 | 14.28 |
| 44785.927083333336 | 13.91 |
| 44785.9375 | 12.92 |
| 44785.947916666664 | 12.88 |
| 44785.958333333336 | 13.15 |
| 44785.96875 | 12.79 |
| 44785.979166666664 | 12.91 |
| 44785.989583333336 | 13.23 |
| 44786.0 | 12.79 |
| 44786.010416666664 | 13.23 |
| 44786.020833333336 | 14.09 |
| 44786.03125 | 12.54 |
| 44786.041666666664 | 12.57 |
| 44786.052083333336 | 12.54 |
| 44786.0625 | 11.32 |
| 44786.072916666664 | 11.65 |
| 44786.083333333336 | 10.46 |
| 44786.09375 | 11.93 |
| 44786.104166666664 | 12.27 |
| 44786.114583333336 | 9.99 |
| 44786.125 | 10.5 |
| 44786.135416666664 | 10.25 |
| 44786.145833333336 | 10.58 |
| 44786.15625 | 10.55 |
| 44786.166666666664 | 10.83 |
| 44786.177083333336 | 9.83 |
| 44786.1875 | 10.12 |
| 44786.197916666664 | 10 |
| 44786.208333333336 | 10.2 |
| 44786.21875 | 10.14 |
| 44786.229166666664 | 10.8 |
| 44786.239583333336 | 10.18 |
| 44786.25 | 9.5 |
| 44786.260416666664 | 10.02 |
| 44786.270833333336 | 11.09 |
| 44786.28125 | 12.07 |
| 44786.291666666664 | 11.9 |
| 44786.302083333336 | 10.53 |
| 44786.3125 | 11.92 |
| 44786.322916666664 | 11.49 |
| 44786.333333333336 | 11.94 |
| 44786.34375 | 12.73 |
| 44786.354166666664 | 12.56 |
| 44786.364583333336 | 11.37 |
| 44786.375 | 11.35 |
| 44786.385416666664 | 10.75 |
| 44786.395833333336 | 10.36 |
| 44786.40625 | 10.58 |
| 44786.416666666664 | 9.91 |
| 44786.427083333336 | 10.04 |
| 44786.4375 | 9.37 |
| 44786.447916666664 | 9.29 |
| 44786.458333333336 | 9.41 |
| 44786.46875 | 9.8 |
| 44786.479166666664 | 10.01 |
| 44786.489583333336 | 9.96 |
| 44786.5 | 9.8 |
| 44786.510416666664 | 9.93 |
| 44786.520833333336 | 9.92 |
| 44786.53125 | 9.48 |
| 44786.541666666664 | 9.53 |
| 44786.552083333336 | 9.45 |
| 44786.5625 | 9.27 |
| 44786.572916666664 | 8.81 |
| 44786.583333333336 | 8.3 |
| 44786.59375 | 8.41 |
| 44786.604166666664 | 8.41 |
| 44786.614583333336 | 8.35 |
| 44786.625 | 8.08 |
| 44786.635416666664 | 7.69 |
| 44786.645833333336 | 7.88 |
| 44786.65625 | 8.19 |
| 44786.666666666664 | 8.45 |
| 44786.677083333336 | 9.3 |
| 44786.6875 | 8.8 |
| 44786.697916666664 | 9.37 |
| 44786.708333333336 | 9.82 |
| 44786.71875 | 10.45 |
| 44786.729166666664 | 12.25 |
| 44786.739583333336 | 12.19 |
| 44786.75 | 12.88 |
| 44786.760416666664 | 12.53 |
| 44786.770833333336 | 12.6 |
| 44786.78125 | 13.59 |
| 44786.791666666664 | 13.37 |
| 44786.802083333336 | 15.06 |
| 44786.8125 | 15.62 |
| 44786.822916666664 | 17.05 |
| 44786.833333333336 | 17.26 |
| 44786.84375 | 18.44 |
| 44786.854166666664 | 21.06 |
| 44786.864583333336 | 22.81 |
| 44786.875 | 20.5 |
| 44786.885416666664 | 21.55 |
| 44786.895833333336 | 22.29 |
| 44786.90625 | 20.37 |
| 44786.916666666664 | 18.63 |
| 44786.927083333336 | 17.83 |
| 44786.9375 | 16.39 |
| 44786.947916666664 | 15.24 |
| 44786.958333333336 | 14.89 |
| 44786.96875 | 14.28 |
| 44786.979166666664 | 13.34 |
| 44786.989583333336 | 13.34 |
| 44787.0 | 12.51 |
| 44787.010416666664 | 13.41 |
| 44787.020833333336 | 13.73 |
| 44787.03125 | 13.57 |
| 44787.041666666664 | 13.14 |
| 44787.052083333336 | 12.96 |
| 44787.0625 | 12.71 |
| 44787.072916666664 | 13.68 |
| 44787.083333333336 | 12.22 |
| 44787.09375 | 12.52 |
| 44787.104166666664 | 12.5 |
| 44787.114583333336 | 13.12 |
| 44787.125 | 12.23 |
| 44787.135416666664 | 12.51 |
| 44787.145833333336 | 11.79 |
| 44787.15625 | 10.7 |
| 44787.166666666664 | 10.75 |
| 44787.177083333336 | 11.02 |
| 44787.1875 | 10.13 |
| 44787.197916666664 | 10.51 |
| 44787.208333333336 | 10.55 |
| 44787.21875 | 10.46 |
| 44787.229166666664 | 10.46 |
| 44787.239583333336 | 10.43 |
| 44787.25 | 10.74 |
| 44787.260416666664 | 10.83 |
| 44787.270833333336 | 10.26 |
| 44787.28125 | 11.09 |
| 44787.291666666664 | 11.39 |
| 44787.302083333336 | 11.91 |
| 44787.3125 | 12.28 |
| 44787.322916666664 | 11.4 |
| 44787.333333333336 | 12.49 |
| 44787.34375 | 11.93 |
| 44787.354166666664 | 12.06 |
| 44787.364583333336 | 11.32 |
| 44787.375 | 11.77 |
| 44787.385416666664 | 11.39 |
| 44787.395833333336 | 11.78 |
| 44787.40625 | 10.59 |
| 44787.416666666664 | 10.7 |
| 44787.427083333336 | 10.69 |
| 44787.4375 | 9.79 |
| 44787.447916666664 | 9.56 |
| 44787.458333333336 | 9.74 |
| 44787.46875 | 9.51 |
| 44787.479166666664 | 9.16 |
| 44787.489583333336 | 9.54 |
| 44787.5 | 9.5 |
| 44787.510416666664 | 9.39 |
| 44787.520833333336 | 9.33 |
| 44787.53125 | 9.89 |
| 44787.541666666664 | 9.78 |
| 44787.552083333336 | 9.88 |
| 44787.5625 | 9.51 |
| 44787.572916666664 | 9.15 |
| 44787.583333333336 | 9.24 |
| 44787.59375 | 9.73 |
| 44787.604166666664 | 9.17 |
| 44787.614583333336 | 9.25 |
| 44787.625 | 9.16 |
| 44787.635416666664 | 9.54 |
| 44787.645833333336 | 8.93 |
| 44787.65625 | 8.19 |
| 44787.666666666664 | 8.96 |
| 44787.677083333336 | 7.78 |
| 44787.6875 | 9.32 |
| 44787.697916666664 | 9.79 |
| 44787.708333333336 | 9.52 |
| 44787.71875 | 9.71 |
| 44787.729166666664 | 9.84 |
| 44787.739583333336 | 10.49 |
| 44787.75 | 10.08 |
| 44787.760416666664 | 11.52 |
| 44787.770833333336 | 12.21 |
| 44787.78125 | 12.29 |
| 44787.791666666664 | 12.32 |
| 44787.802083333336 | 14.22 |
| 44787.8125 | 13.54 |
| 44787.822916666664 | 17.33 |
| 44787.833333333336 | 16.74 |
| 44787.84375 | 16.95 |
| 44787.854166666664 | 18.03 |
| 44787.864583333336 | 18.09 |
| 44787.875 | 19.68 |
| 44787.885416666664 | 19.86 |
| 44787.895833333336 | 20.97 |
| 44787.90625 | 19.73 |
| 44787.916666666664 | 19.23 |
| 44787.927083333336 | 20.96 |
| 44787.9375 | 18.25 |
| 44787.947916666664 | 17.83 |
| 44787.958333333336 | 17.3 |
| 44787.96875 | 15.56 |
| 44787.979166666664 | 14.77 |
| 44787.989583333336 | 14.51 |
| 44788.0 | 13.87 |
| 44788.010416666664 | 13.27 |
| 44788.020833333336 | 12.74 |
| 44788.03125 | 12.82 |
| 44788.041666666664 | 12.78 |
| 44788.052083333336 | 12.18 |
| 44788.0625 | 12.12 |
| 44788.072916666664 | 12.11 |
| 44788.083333333336 | 11.63 |
| 44788.09375 | 11.84 |
| 44788.104166666664 | 11.9 |
| 44788.114583333336 | 12.01 |
| 44788.125 | 11.83 |
| 44788.135416666664 | 11.84 |
| 44788.145833333336 | 12.42 |
| 44788.15625 | 12.28 |
| 44788.166666666664 | 13.09 |
| 44788.177083333336 | 10.1 |
| 44788.1875 | 10.71 |
| 44788.197916666664 | 10.53 |
| 44788.208333333336 | 9.79 |
| 44788.21875 | 26.92 |
| 44788.229166666664 | 10.29 |
| 44788.239583333336 | 11.28 |
| 44788.25 | 10.5 |
| 44788.260416666664 | 9.49 |
| 44788.270833333336 | 9.24 |
| 44788.28125 | 9.23 |
| 44788.291666666664 | 9.56 |
| 44788.302083333336 | 9.97 |
| 44788.3125 | 10.55 |
| 44788.322916666664 | 10.85 |
| 44788.333333333336 | 11.53 |
| 44788.34375 | 11.34 |
| 44788.354166666664 | 11.6 |
| 44788.364583333336 | 11.46 |
| 44788.375 | 10.55 |
| 44788.385416666664 | 11.02 |
| 44788.395833333336 | 11.28 |
| 44788.40625 | 11.05 |
| 44788.416666666664 | 10.78 |
| 44788.427083333336 | 10.34 |
| 44788.4375 | 10.32 |
| 44788.447916666664 | 10.13 |
| 44788.458333333336 | 9.3 |
| 44788.46875 | 9.14 |
| 44788.479166666664 | 9.08 |
| 44788.489583333336 | 9.14 |
| 44788.5 | 8.89 |
| 44788.510416666664 | 9.09 |
| 44788.520833333336 | 9.54 |
| 44788.53125 | 9.37 |
| 44788.541666666664 | 9.43 |
| 44788.552083333336 | 9.35 |
| 44788.5625 | 9.74 |
| 44788.572916666664 | 9.61 |
| 44788.583333333336 | 9.14 |
| 44788.59375 | 9.36 |
| 44788.604166666664 | 9.22 |
| 44788.614583333336 | 9.19 |
| 44788.625 | 9.49 |
| 44788.635416666664 | 9.67 |
| 44788.645833333336 | 10.21 |
| 44788.65625 | 9.93 |
| 44788.666666666664 | 9.31 |
| 44788.677083333336 | 9.68 |
| 44788.6875 | 9.57 |
| 44788.697916666664 | 10.87 |
| 44788.708333333336 | 10.93 |
| 44788.71875 | 10.64 |
| 44788.729166666664 | 11.55 |
| 44788.739583333336 | 12.46 |
| 44788.75 | 12.35 |
| 44788.760416666664 | 12.97 |
| 44788.770833333336 | 12.3 |
| 44788.78125 | 12.12 |
| 44788.791666666664 | 12.35 |
| 44788.802083333336 | 12.89 |
| 44788.8125 | 12.67 |
| 44788.822916666664 | 13.64 |
| 44788.833333333336 | 15.07 |
| 44788.84375 | 15.03 |
| 44788.854166666664 | 15.57 |
| 44788.864583333336 | 16.66 |
| 44788.875 | 16.62 |
| 44788.885416666664 | 15.16 |
| 44788.895833333336 | 17.3 |
| 44788.90625 | 17.49 |
| 44788.916666666664 | 17.97 |
| 44788.927083333336 | 18.34 |
| 44788.9375 | 17.18 |
| 44788.947916666664 | 15.62 |
| 44788.958333333336 | 16.08 |
| 44788.96875 | 14.61 |
| 44788.979166666664 | 13.86 |
| 44788.989583333336 | 13.77 |
| 44789.0 | 14.91 |
| 44789.010416666664 | 13.32 |
| 44789.020833333336 | 13.18 |
| 44789.03125 | 12.97 |
| 44789.041666666664 | 12.3 |
| 44789.052083333336 | 12.39 |
| 44789.0625 | 10.5 |
| 44789.072916666664 | 11.83 |
| 44789.083333333336 | 12.2 |
| 44789.09375 | 11.89 |
| 44789.104166666664 | 11.34 |
| 44789.114583333336 | 13.84 |
| 44789.125 | 11.51 |
| 44789.135416666664 | 11.56 |
| 44789.145833333336 | 12.06 |
| 44789.15625 | 11.44 |
| 44789.166666666664 | 12.02 |
| 44789.177083333336 | 10.46 |
| 44789.1875 | 11.84 |
| 44789.197916666664 | 12.28 |
| 44789.208333333336 | 11.47 |
| 44789.21875 | 10.28 |
| 44789.229166666664 | 9.98 |
| 44789.239583333336 | 10.21 |
| 44789.25 | 10.18 |
| 44789.260416666664 | 9.87 |
| 44789.270833333336 | 10.28 |
| 44789.28125 | 9.89 |
| 44789.291666666664 | 9.75 |
| 44789.302083333336 | 9.19 |
| 44789.3125 | 9.74 |
| 44789.322916666664 | 10.18 |
| 44789.333333333336 | 9.27 |
| 44789.34375 | 9.86 |
| 44789.354166666664 | 10.2 |
| 44789.364583333336 | 10.59 |
| 44789.375 | 10.52 |
| 44789.385416666664 | 10.81 |
| 44789.395833333336 | 10.52 |
| 44789.40625 | 10.99 |
| 44789.416666666664 | 10.55 |
| 44789.427083333336 | 10.27 |
| 44789.4375 | 11.14 |
| 44789.447916666664 | 10.55 |
| 44789.458333333336 | 9.62 |
| 44789.46875 | 8.69 |
| 44789.479166666664 | 8.91 |
| 44789.489583333336 | 9.18 |
| 44789.5 | 8.85 |
| 44789.510416666664 | 9.12 |
| 44789.520833333336 | 9.23 |
| 44789.53125 | 9.34 |
| 44789.541666666664 | 9.59 |
| 44789.552083333336 | 9.74 |
| 44789.5625 | 9.36 |
| 44789.572916666664 | 9.26 |
| 44789.583333333336 | 9.58 |
| 44789.59375 | 9.44 |
| 44789.604166666664 | 8.82 |
| 44789.614583333336 | 8.8 |
| 44789.625 | 9.36 |
| 44789.635416666664 | 8.83 |
| 44789.645833333336 | 9.02 |
| 44789.65625 | 9.31 |
| 44789.666666666664 | 8.71 |
| 44789.677083333336 | 8.47 |
| 44789.6875 | 8.76 |
| 44789.697916666664 | 8.29 |
| 44789.708333333336 | 8.73 |
| 44789.71875 | 8.8 |
| 44789.729166666664 | 8.28 |
| 44789.739583333336 | 8.39 |
| 44789.75 | 8.6 |
| 44789.760416666664 | 9.42 |
| 44789.770833333336 | 8.93 |
| 44789.78125 | 9.34 |
| 44789.791666666664 | 9.05 |
| 44789.802083333336 | 11.8 |
| 44789.8125 | 11.99 |
| 44789.822916666664 | 11.26 |
| 44789.833333333336 | 12.63 |
| 44789.84375 | 12.61 |
| 44789.854166666664 | 13.67 |
| 44789.864583333336 | 12.94 |
| 44789.875 | 15.02 |
| 44789.885416666664 | 16.27 |
| 44789.895833333336 | 15.9 |
| 44789.90625 | 16.51 |
| 44789.916666666664 | 17.44 |
| 44789.927083333336 | 15.83 |
| 44789.9375 | 16.91 |
| 44789.947916666664 | 16.82 |
| 44789.958333333336 | 16.04 |
| 44789.96875 | 15.51 |
| 44789.979166666664 | 13.56 |
| 44789.989583333336 | 12.39 |
| 44790.0 | 14.7 |
| 44790.010416666664 | 15.09 |
| 44790.020833333336 | 14.4 |
| 44790.03125 | 13 |
| 44790.041666666664 | 13.05 |
| 44790.052083333336 | 13.91 |
| 44790.0625 | 11.76 |
| 44790.072916666664 | 11.55 |
| 44790.083333333336 | 11.41 |
| 44790.09375 | 11.24 |
| 44790.104166666664 | 10.62 |
| 44790.114583333336 | 10.92 |
| 44790.125 | 10.28 |
| 44790.135416666664 | 11.24 |
| 44790.145833333336 | 10.48 |
| 44790.15625 | 10.18 |
| 44790.166666666664 | 10.85 |
| 44790.177083333336 | 12.31 |
| 44790.1875 | 12.41 |
| 44790.197916666664 | 12.46 |
| 44790.208333333336 | 12.06 |
| 44790.21875 | 11.69 |
| 44790.229166666664 | 12.58 |
| 44790.239583333336 | 9.18 |
| 44790.25 | 10.36 |
| 44790.260416666664 | 10.38 |
| 44790.270833333336 | 9.61 |
| 44790.28125 | 10.24 |
| 44790.291666666664 | 9.83 |
| 44790.302083333336 | 9.45 |
| 44790.3125 | 9.83 |
| 44790.322916666664 | 9.16 |
| 44790.333333333336 | 9.62 |
| 44790.34375 | 9.76 |
| 44790.354166666664 | 10.2 |
| 44790.364583333336 | 9.8 |
| 44790.375 | 9.91 |
| 44790.385416666664 | 10.44 |
| 44790.395833333336 | 10.01 |
| 44790.40625 | 10.34 |
| 44790.416666666664 | 10.82 |
| 44790.427083333336 | 10.83 |
| 44790.4375 | 10.47 |
| 44790.447916666664 | 10.67 |
| 44790.458333333336 | 11.36 |
| 44790.46875 | 10.56 |
| 44790.479166666664 | 10.84 |
| 44790.489583333336 | 11.53 |
| 44790.5 | 9.91 |
| 44790.510416666664 | 10.52 |
| 44790.520833333336 | 10.64 |
| 44790.53125 | 10.19 |
| 44790.541666666664 | 9.88 |
| 44790.552083333336 | 10.63 |
| 44790.5625 | 9.81 |
| 44790.572916666664 | 9.57 |
| 44790.583333333336 | 9.15 |
| 44790.59375 | 8.9 |
| 44790.604166666664 | 8.92 |
| 44790.614583333336 | 9.21 |
| 44790.625 | 8.97 |
| 44790.635416666664 | 8.57 |
| 44790.645833333336 | 8.5 |
| 44790.65625 | 8.16 |
| 44790.666666666664 | 9.1 |
| 44790.677083333336 | 8.5 |
| 44790.6875 | 8.97 |
| 44790.697916666664 | 8.71 |
| 44790.708333333336 | 8.47 |
| 44790.71875 | 8.93 |
| 44790.729166666664 | 8.85 |
| 44790.739583333336 | 8.8 |
| 44790.75 | 9.14 |
| 44790.760416666664 | 11.05 |
| 44790.770833333336 | 11.35 |
| 44790.78125 | 10.68 |
| 44790.791666666664 | 11.08 |
| 44790.802083333336 | 11.83 |
| 44790.8125 | 11.82 |
| 44790.822916666664 | 12.69 |
| 44790.833333333336 | 14.29 |
| 44790.84375 | 13.31 |
| 44790.854166666664 | 13.29 |
| 44790.864583333336 | 13.59 |
| 44790.875 | 15.87 |
| 44790.885416666664 | 15.21 |
| 44790.895833333336 | 16.59 |
| 44790.90625 | 16.23 |
| 44790.916666666664 | 15.17 |
| 44790.927083333336 | 15.86 |
| 44790.9375 | 15.81 |
| 44790.947916666664 | 16.98 |
| 44790.958333333336 | 17.27 |
| 44790.96875 | 17.27 |
| 44790.979166666664 | 18.9 |
| 44790.989583333336 | 18.05 |
| 44791.0 | 18.81 |
| 44791.010416666664 | 22.6 |
| 44791.020833333336 | 23.41 |
| 44791.03125 | 17.11 |
| 44791.041666666664 | 17.08 |
| 44791.052083333336 | 17.54 |
| 44791.0625 | 17.32 |
| 44791.072916666664 | 15.75 |
| 44791.083333333336 | 16.48 |
| 44791.09375 | 14.44 |
| 44791.104166666664 | 13.79 |
| 44791.114583333336 | 12.32 |
| 44791.125 | 12 |
| 44791.135416666664 | 12.15 |
| 44791.145833333336 | 11.67 |
| 44791.15625 | 12.33 |
| 44791.166666666664 | 11.62 |
| 44791.177083333336 | 12.65 |
| 44791.1875 | 12.5 |
| 44791.197916666664 | 12.37 |
| 44791.208333333336 | 14.78 |
| 44791.21875 | 12.71 |
| 44791.229166666664 | 13.15 |
| 44791.239583333336 | 12.3 |
| 44791.25 | 11.52 |
| 44791.260416666664 | 11.2 |
| 44791.270833333336 | 10.83 |
| 44791.28125 | 11.1 |
| 44791.291666666664 | 10.37 |
| 44791.302083333336 | 9.75 |
| 44791.3125 | 10.47 |
| 44791.322916666664 | 9.93 |
| 44791.333333333336 | 10.21 |
| 44791.34375 | 9.3 |
| 44791.354166666664 | 9.18 |
| 44791.364583333336 | 9.68 |
| 44791.375 | 9.43 |
| 44791.385416666664 | 10.49 |
| 44791.395833333336 | 9.96 |
| 44791.40625 | 10.6 |
| 44791.416666666664 | 10.49 |
| 44791.427083333336 | 11.74 |
| 44791.4375 | 10.72 |
| 44791.447916666664 | 10.08 |
| 44791.458333333336 | 11.36 |
| 44791.46875 | 11.66 |
| 44791.479166666664 | 11.09 |
| 44791.489583333336 | 11.3 |
| 44791.5 | 11.47 |
| 44791.510416666664 | 12.2 |
| 44791.520833333336 | 12.7 |
| 44791.53125 | 11.58 |
| 44791.541666666664 | 11.68 |
| 44791.552083333336 | 10.83 |
| 44791.5625 | 10.6 |
| 44791.572916666664 | 9.76 |
| 44791.583333333336 | 9.92 |
| 44791.59375 | 9.62 |
| 44791.604166666664 | 9.62 |
| 44791.614583333336 | 8.75 |
| 44791.625 | 9.24 |
| 44791.635416666664 | 9.31 |
| 44791.645833333336 | 8.81 |
| 44791.65625 | 8.84 |
| 44791.666666666664 | 9.3 |
| 44791.677083333336 | 8.61 |
| 44791.6875 | 9.12 |
| 44791.697916666664 | 8.45 |
| 44791.708333333336 | 9.1 |
| 44791.71875 | 9.44 |
| 44791.729166666664 | 9.48 |
| 44791.739583333336 | 9.56 |
| 44791.75 | 9.95 |
| 44791.760416666664 | 11.06 |
| 44791.770833333336 | 11.27 |
| 44791.78125 | 13.28 |
| 44791.791666666664 | 11.49 |
| 44791.802083333336 | 12.95 |
| 44791.8125 | 15.06 |
| 44791.822916666664 | 12.46 |
| 44791.833333333336 | 13.12 |
| 44791.84375 | 14.94 |
| 44791.854166666664 | 13.73 |
| 44791.864583333336 | 13.67 |
| 44791.875 | 13.66 |
| 44791.885416666664 | 13.78 |
| 44791.895833333336 | 14.11 |
| 44791.90625 | 13.45 |
| 44791.916666666664 | 13.15 |
| 44791.927083333336 | 13.29 |
| 44791.9375 | 14.39 |
| 44791.947916666664 | 13.04 |
| 44791.958333333336 | 13.86 |
| 44791.96875 | 14.02 |
| 44791.979166666664 | 13.71 |
| 44791.989583333336 | 14.94 |
| 44792.0 | 15.67 |
| 44792.010416666664 | 16.82 |
| 44792.020833333336 | 16.79 |
| 44792.03125 | 17.41 |
| 44792.041666666664 | 17.24 |
| 44792.052083333336 | 13.88 |
| 44792.0625 | 13.5 |
| 44792.072916666664 | 13.47 |
| 44792.083333333336 | 14.39 |
| 44792.09375 | 13.48 |
| 44792.104166666664 | 12.88 |
| 44792.114583333336 | 11.93 |
| 44792.125 | 12.34 |
| 44792.135416666664 | 12.07 |
| 44792.145833333336 | 11.13 |
| 44792.15625 | 11.02 |
| 44792.166666666664 | 11.32 |
| 44792.177083333336 | 10.92 |
| 44792.1875 | 10.91 |
| 44792.197916666664 | 10.34 |
| 44792.208333333336 | 10.8 |
| 44792.21875 | 10.53 |
| 44792.229166666664 | 15.16 |
| 44792.239583333336 | 10.67 |
| 44792.25 | 10.88 |
| 44792.260416666664 | 10.37 |
| 44792.270833333336 | 10.25 |
| 44792.28125 | 10.63 |
| 44792.291666666664 | 8.36 |
| 44792.302083333336 | 8.38 |
| 44792.3125 | 9.44 |
| 44792.322916666664 | 8.33 |
| 44792.333333333336 | 8.56 |
| 44792.34375 | 8.03 |
| 44792.354166666664 | 8.97 |
| 44792.364583333336 | 9.1 |
| 44792.375 | 9.25 |
| 44792.385416666664 | 8.82 |
| 44792.395833333336 | 9.39 |
| 44792.40625 | 9.94 |
| 44792.416666666664 | 10.6 |
| 44792.427083333336 | 9.72 |
| 44792.4375 | 9.52 |
| 44792.447916666664 | 9.97 |
| 44792.458333333336 | 10.57 |
| 44792.46875 | 11.11 |
| 44792.479166666664 | 10.69 |
| 44792.489583333336 | 15.06 |
| 44792.5 | 12.04 |
| 44792.510416666664 | 11.4 |
| 44792.520833333336 | 11.94 |
| 44792.53125 | 12.78 |
| 44792.541666666664 | 12.45 |
| 44792.552083333336 | 11.23 |
| 44792.5625 | 10.59 |
| 44792.572916666664 | 10.53 |
| 44792.583333333336 | 9.92 |
| 44792.59375 | 9.4 |
| 44792.604166666664 | 9.62 |
| 44792.614583333336 | 10.86 |
| 44792.625 | 10.56 |
| 44792.635416666664 | 9.9 |
| 44792.645833333336 | 9.13 |
| 44792.65625 | 8.88 |
| 44792.666666666664 | 4.79 |
| 44792.677083333336 | 4.75 |
| 44792.6875 | 4.57 |
| 44792.697916666664 | 4.25 |
| 44792.708333333336 | 5.5 |
| 44792.71875 | 5.35 |
| 44792.729166666664 | 5.68 |
| 44792.739583333336 | 5.81 |
| 44792.75 | 5.6 |
| 44792.760416666664 | 6.51 |
| 44792.770833333336 | 6.02 |
| 44792.78125 | 6.27 |
| 44792.791666666664 | 6.55 |
| 44792.802083333336 | 7.31 |
| 44792.8125 | 6.88 |
| 44792.822916666664 | 7.2 |
| 44792.833333333336 | 6.04 |
| 44792.84375 | 9.56 |
| 44792.854166666664 | 11.33 |
| 44792.864583333336 | 9.66 |
| 44792.875 | 7.45 |
| 44792.885416666664 | 9.26 |
| 44792.895833333336 | 7.89 |
| 44792.90625 | 7.73 |
| 44792.916666666664 | 7.61 |
| 44792.927083333336 | 6.72 |
| 44792.9375 | 6.67 |
| 44792.947916666664 | 7.12 |
| 44792.958333333336 | 7.67 |
| 44792.96875 | 8.46 |
| 44792.979166666664 | 8.9 |
| 44792.989583333336 | 9.38 |
| 44793.0 | 11.13 |
| 44793.010416666664 | 11.14 |
| 44793.020833333336 | 10.99 |
| 44793.03125 | 10.85 |
| 44793.041666666664 | 10.92 |
| 44793.052083333336 | 10.97 |
| 44793.0625 | 11.38 |
| 44793.072916666664 | 11.1 |
| 44793.083333333336 | 15.44 |
| 44793.09375 | 13.87 |
| 44793.104166666664 | 10.77 |
| 44793.114583333336 | 9.95 |
| 44793.125 | 9.29 |
| 44793.135416666664 | 9.26 |
| 44793.145833333336 | 8.64 |
| 44793.15625 | 9.14 |
| 44793.166666666664 | 7.72 |
| 44793.177083333336 | 7.23 |
| 44793.1875 | 7.59 |
| 44793.197916666664 | 7.35 |
| 44793.208333333336 | 6.97 |
| 44793.21875 | 7.27 |
| 44793.229166666664 | 6.76 |
| 44793.239583333336 | 5.76 |
| 44793.25 | 6.17 |
| 44793.260416666664 | 5.57 |
| 44793.270833333336 | 5.31 |
| 44793.28125 | 5.81 |
| 44793.291666666664 | 5.94 |
| 44793.302083333336 | 5.27 |
| 44793.3125 | 5.19 |
| 44793.322916666664 | 6.07 |
| 44793.333333333336 | 4.55 |
| 44793.34375 | 4.61 |
| 44793.354166666664 | 5.15 |
| 44793.364583333336 | 4.44 |
| 44793.375 | 4.4 |
| 44793.385416666664 | 4.46 |
| 44793.395833333336 | 4.31 |
| 44793.40625 | 4.55 |
| 44793.416666666664 | 4.67 |
| 44793.427083333336 | 4.72 |
| 44793.4375 | 5.15 |
| 44793.447916666664 | 4.86 |
| 44793.458333333336 | 5.22 |
| 44793.46875 | 5.91 |
| 44793.479166666664 | 5.82 |
| 44793.489583333336 | 6.35 |
| 44793.5 | 6.96 |
| 44793.510416666664 | 6.66 |
| 44793.520833333336 | 7.41 |
| 44793.53125 | 7.42 |
| 44793.541666666664 | 7.85 |
| 44793.552083333336 | 8.76 |
| 44793.5625 | 8.87 |
| 44793.572916666664 | 9.5 |
| 44793.583333333336 | 10.14 |
| 44793.59375 | 11.59 |
| 44793.604166666664 | 9.41 |
| 44793.614583333336 | 7.73 |
| 44793.625 | 8.3 |
| 44793.635416666664 | 8.53 |
| 44793.645833333336 | 6.98 |
| 44793.65625 | 6.66 |
| 44793.666666666664 | 6.87 |
| 44793.677083333336 | 6.01 |
| 44793.6875 | 5.4 |
| 44793.697916666664 | 5.33 |
| 44793.708333333336 | 4.96 |
| 44793.71875 | 5.42 |
| 44793.729166666664 | 5.16 |
| 44793.739583333336 | 5.35 |
| 44793.75 | 5.37 |
| 44793.760416666664 | 5.65 |
| 44793.770833333336 | 5.21 |
| 44793.78125 | 5.87 |
| 44793.791666666664 | 6 |
| 44793.802083333336 | 7.13 |
| 44793.8125 | 7.33 |
| 44793.822916666664 | 6.73 |
| 44793.833333333336 | 9.59 |
| 44793.84375 | 8.51 |
| 44793.854166666664 | 9.81 |
| 44793.864583333336 | 9.36 |
| 44793.875 | 11.84 |
| 44793.885416666664 | 11.71 |
| 44793.895833333336 | 11.23 |
| 44793.90625 | 11.03 |
| 44793.916666666664 | 10.36 |
| 44793.927083333336 | 10.25 |
| 44793.9375 | 9.17 |
| 44793.947916666664 | 9.19 |
| 44793.958333333336 | 10.29 |
| 44793.96875 | 10.38 |
| 44793.979166666664 | 9.51 |
| 44793.989583333336 | 8.27 |
| 44794.0 | 9.61 |
| 44794.010416666664 | 10.5 |
| 44794.020833333336 | 11.41 |
| 44794.03125 | 12.03 |
| 44794.041666666664 | 11.43 |
| 44794.052083333336 | 11.41 |
| 44794.0625 | 11.42 |
| 44794.072916666664 | 12.32 |
| 44794.083333333336 | 12.78 |
| 44794.09375 | 15.93 |
| 44794.104166666664 | 13.82 |
| 44794.114583333336 | 14.75 |
| 44794.125 | 16.7 |
| 44794.135416666664 | 13.48 |
| 44794.145833333336 | 11.92 |
| 44794.15625 | 12.36 |
| 44794.166666666664 | 12.74 |
| 44794.177083333336 | 10.45 |
| 44794.1875 | 9.53 |
| 44794.197916666664 | 9.28 |
| 44794.208333333336 | 9.45 |
| 44794.21875 | 9.43 |
| 44794.229166666664 | 8.51 |
| 44794.239583333336 | 8.42 |
| 44794.25 | 8.25 |
| 44794.260416666664 | 8.1 |
| 44794.270833333336 | 8.05 |
| 44794.28125 | 7.54 |
| 44794.291666666664 | 6.66 |
| 44794.302083333336 | 8.5 |
| 44794.3125 | 6.6 |
| 44794.322916666664 | 7.59 |
| 44794.333333333336 | 7 |
| 44794.34375 | 6.16 |
| 44794.354166666664 | 6.46 |
| 44794.364583333336 | 5.82 |
| 44794.375 | 6.46 |
| 44794.385416666664 | 6.24 |
| 44794.395833333336 | 6.42 |
| 44794.40625 | 5.94 |
| 44794.416666666664 | 5.59 |
| 44794.427083333336 | 5.46 |
| 44794.4375 | 4.95 |
| 44794.447916666664 | 4.88 |
| 44794.458333333336 | 5.02 |
| 44794.46875 | 5.49 |
| 44794.479166666664 | 5.18 |
| 44794.489583333336 | 5.65 |
| 44794.5 | 6.29 |
| 44794.510416666664 | 6.81 |
| 44794.520833333336 | 7.38 |
| 44794.53125 | 7.83 |
| 44794.541666666664 | 8.05 |
| 44794.552083333336 | 9.21 |
| 44794.5625 | 9.23 |
| 44794.572916666664 | 9.91 |
| 44794.583333333336 | 11.06 |
| 44794.59375 | 10.99 |
| 44794.604166666664 | 14.13 |
| 44794.614583333336 | 13.92 |
| 44794.625 | 15.86 |
| 44794.635416666664 | 18.21 |
| 44794.645833333336 | 15.18 |
| 44794.65625 | 11.72 |
| 44794.666666666664 | 10.92 |
| 44794.677083333336 | 10.08 |
| 44794.6875 | 9.64 |
| 44794.697916666664 | 9.78 |
| 44794.708333333336 | 8.95 |
| 44794.71875 | 8.74 |
| 44794.729166666664 | 8.41 |
| 44794.739583333336 | 7.01 |
| 44794.75 | 7.41 |
| 44794.760416666664 | 7.46 |
| 44794.770833333336 | 8.16 |
| 44794.78125 | 8.74 |
| 44794.791666666664 | 8.78 |
| 44794.802083333336 | 10.31 |
| 44794.8125 | 10.1 |
| 44794.822916666664 | 12.05 |
| 44794.833333333336 | 11.05 |
| 44794.84375 | 12.27 |
| 44794.854166666664 | 15.31 |
| 44794.864583333336 | 12.31 |
| 44794.875 | 11.95 |
| 44794.885416666664 | 13.69 |
| 44794.895833333336 | 13.42 |
| 44794.90625 | 13.2 |
| 44794.916666666664 | 13.81 |
| 44794.927083333336 | 14.76 |
| 44794.9375 | 16.52 |
| 44794.947916666664 | 17.11 |
| 44794.958333333336 | 18 |
| 44794.96875 | 15.81 |
| 44794.979166666664 | 15.46 |
| 44794.989583333336 | 15.31 |
| 44795.0 | 14.66 |
| 44795.010416666664 | 14.97 |
| 44795.020833333336 | 14.61 |
| 44795.03125 | 16.49 |
| 44795.041666666664 | 13.32 |
| 44795.052083333336 | 13.71 |
| 44795.0625 | 13.66 |
| 44795.072916666664 | 13.59 |
| 44795.083333333336 | 16.25 |
| 44795.09375 | 14.27 |
| 44795.104166666664 | 14.53 |
| 44795.114583333336 | 15.01 |
| 44795.125 | 14.87 |
| 44795.135416666664 | 15.17 |
| 44795.145833333336 | 17.66 |
| 44795.15625 | 16.71 |
| 44795.166666666664 | 17.12 |
| 44795.177083333336 | 14.22 |
| 44795.1875 | 13.94 |
| 44795.197916666664 | 19.74 |
| 44795.208333333336 | 12.38 |
| 44795.21875 | 11.28 |
| 44795.229166666664 | 12.4 |
| 44795.239583333336 | 9.9 |
| 44795.25 | 9.92 |
| 44795.260416666664 | 9.34 |
| 44795.270833333336 | 11.15 |
| 44795.28125 | 10.53 |
| 44795.291666666664 | 11.38 |
| 44795.302083333336 | 9.34 |
| 44795.3125 | 10.88 |
| 44795.322916666664 | 9.56 |
| 44795.333333333336 | 8.27 |
| 44795.34375 | 9.12 |
| 44795.354166666664 | 8.19 |
| 44795.364583333336 | 8.03 |
| 44795.375 | 8.59 |
| 44795.385416666664 | 7.89 |
| 44795.395833333336 | 7.55 |
| 44795.40625 | 7.95 |
| 44795.416666666664 | 7.52 |
| 44795.427083333336 | 8.13 |
| 44795.4375 | 6.92 |
| 44795.447916666664 | 5.53 |
| 44795.458333333336 | 5.66 |
| 44795.46875 | 5.76 |
| 44795.479166666664 | 5.85 |
| 44795.489583333336 | 5.68 |
| 44795.5 | 6.25 |
| 44795.510416666664 | 6.18 |
| 44795.520833333336 | 6.03 |
| 44795.53125 | 8.39 |
| 44795.541666666664 | 8.02 |
| 44795.552083333336 | 7.99 |
| 44795.5625 | 7.88 |
| 44795.572916666664 | 8.97 |
| 44795.583333333336 | 9.93 |
| 44795.59375 | 9.81 |
| 44795.604166666664 | 11.38 |
| 44795.614583333336 | 11.99 |
| 44795.625 | 13.27 |
| 44795.635416666664 | 14.55 |
| 44795.645833333336 | 14.75 |
| 44795.65625 | 18.87 |
| 44795.666666666664 | 12.96 |
| 44795.677083333336 | 14.47 |
| 44795.6875 | 8.82 |
| 44795.697916666664 | 11.23 |
| 44795.708333333336 | 9.16 |
| 44795.71875 | 7.18 |
| 44795.729166666664 | 7.71 |
| 44795.739583333336 | 7.29 |
| 44795.75 | 6.7 |
| 44795.760416666664 | 6.39 |
| 44795.770833333336 | 6.88 |
| 44795.78125 | 6.27 |
| 44795.791666666664 | 6.63 |
| 44795.802083333336 | 6.63 |
| 44795.8125 | 6.91 |
| 44795.822916666664 | 6.62 |
| 44795.833333333336 | 8.24 |
| 44795.84375 | 7.19 |
| 44795.854166666664 | 7.17 |
| 44795.864583333336 | 6.59 |
| 44795.875 | 7.69 |
| 44795.885416666664 | 8.45 |
| 44795.895833333336 | 8.78 |
| 44795.90625 | 7.77 |
| 44795.916666666664 | 8.5 |
| 44795.927083333336 | 10.06 |
| 44795.9375 | 9.77 |
| 44795.947916666664 | 9.74 |
| 44795.958333333336 | 8.88 |
| 44795.96875 | 10.59 |
| 44795.979166666664 | 11.97 |
| 44795.989583333336 | 10.05 |
| 44796.0 | 11.06 |
| 44796.010416666664 | 10.52 |
| 44796.020833333336 | 10.61 |
| 44796.03125 | 9.02 |
| 44796.041666666664 | 10.1 |
| 44796.052083333336 | 8.66 |
| 44796.0625 | 8.89 |
| 44796.072916666664 | 8.65 |
| 44796.083333333336 | 8.87 |
| 44796.09375 | 9.13 |
| 44796.104166666664 | 8.27 |
| 44796.114583333336 | 9.09 |
| 44796.125 | 10.08 |
| 44796.135416666664 | 10.5 |
| 44796.145833333336 | 10.88 |
| 44796.15625 | 11.07 |
| 44796.166666666664 | 10.91 |
| 44796.177083333336 | 12.76 |
| 44796.1875 | 15.61 |
| 44796.197916666664 | 16.56 |
| 44796.208333333336 | 12.68 |
| 44796.21875 | 13.15 |
| 44796.229166666664 | 12.64 |
| 44796.239583333336 | 11.72 |
| 44796.25 | 11.26 |
| 44796.260416666664 | 9.58 |
| 44796.270833333336 | 8.74 |
| 44796.28125 | 7.75 |
| 44796.291666666664 | 7.49 |
| 44796.302083333336 | 7.22 |
| 44796.3125 | 6.8 |
| 44796.322916666664 | 6.08 |
| 44796.333333333336 | 6.29 |
| 44796.34375 | 5.95 |
| 44796.354166666664 | 6.01 |
| 44796.364583333336 | 5.87 |
| 44796.375 | 5.87 |
| 44796.385416666664 | 5.22 |
| 44796.395833333336 | 6.09 |
| 44796.40625 | 5.95 |
| 44796.416666666664 | 6.08 |
| 44796.427083333336 | 5.58 |
| 44796.4375 | 6.13 |
| 44796.447916666664 | 4.18 |
| 44796.458333333336 | 3.7 |
| 44796.46875 | 5.14 |
| 44796.479166666664 | 3.93 |
| 44796.489583333336 | 4.09 |
| 44796.5 | 4.58 |
| 44796.510416666664 | 4.39 |
| 44796.520833333336 | 4.63 |
| 44796.53125 | 4.54 |
| 44796.541666666664 | 4.95 |
| 44796.552083333336 | 5.27 |
| 44796.5625 | 4.79 |
| 44796.572916666664 | 5.62 |
| 44796.583333333336 | 6.58 |
| 44796.59375 | 6.65 |
| 44796.604166666664 | 6.51 |
| 44796.614583333336 | 7.83 |
| 44796.625 | 9.28 |
| 44796.635416666664 | 10.15 |
| 44796.645833333336 | 11.88 |
| 44796.65625 | 11.64 |
| 44796.666666666664 | 15.59 |
| 44796.677083333336 | 16.55 |
| 44796.6875 | 14.87 |
| 44796.697916666664 | 14.09 |
| 44796.708333333336 | 14.46 |
| 44796.71875 | 16.2 |
| 44796.729166666664 | 14.8 |
| 44796.739583333336 | 13.27 |
| 44796.75 | 12.04 |
| 44796.760416666664 | 12.45 |
| 44796.770833333336 | 9.92 |
| 44796.78125 | 8.63 |
| 44796.791666666664 | 8.16 |
| 44796.802083333336 | 7.35 |
| 44796.8125 | 7.41 |
| 44796.822916666664 | 6.43 |
| 44796.833333333336 | 6.49 |
| 44796.84375 | 6.36 |
| 44796.854166666664 | 6.38 |
| 44796.864583333336 | 6.81 |
| 44796.875 | 6.92 |
| 44796.885416666664 | 7.45 |
| 44796.895833333336 | 7.72 |
| 44796.90625 | 8.18 |
| 44796.916666666664 | 8.44 |
| 44796.927083333336 | 9.25 |
| 44796.9375 | 9.33 |
| 44796.947916666664 | 10.44 |
| 44796.958333333336 | 12.82 |
| 44796.96875 | 10.66 |
| 44796.979166666664 | 12.3 |
| 44796.989583333336 | 8.88 |
| 44797.0 | 10.12 |
| 44797.010416666664 | 11.63 |
| 44797.020833333336 | 11.43 |
| 44797.03125 | 10.93 |
| 44797.041666666664 | 11.64 |
| 44797.052083333336 | 11.48 |
| 44797.0625 | 10.54 |
| 44797.072916666664 | 9.85 |
| 44797.083333333336 | 9.33 |
| 44797.09375 | 8.47 |
| 44797.104166666664 | 8.5 |
| 44797.114583333336 | 9.05 |
| 44797.125 | 9.04 |
| 44797.135416666664 | 9.56 |
| 44797.145833333336 | 10.75 |
| 44797.15625 | 10.34 |
| 44797.166666666664 | 11.3 |
| 44797.177083333336 | 11.49 |
| 44797.1875 | 11.61 |
| 44797.197916666664 | 11.81 |
| 44797.208333333336 | 12.32 |
| 44797.21875 | 13.85 |
| 44797.229166666664 | 14.38 |
| 44797.239583333336 | 15.54 |
| 44797.25 | 15.02 |
| 44797.260416666664 | 11.28 |
| 44797.270833333336 | 12.3 |
| 44797.28125 | 12.1 |
| 44797.291666666664 | 11.88 |
| 44797.302083333336 | 10.02 |
| 44797.3125 | 8.96 |
| 44797.322916666664 | 8.66 |
| 44797.333333333336 | 7.66 |
| 44797.34375 | 6.68 |
| 44797.354166666664 | 5.99 |
| 44797.364583333336 | 5.95 |
| 44797.375 | 5.16 |
| 44797.385416666664 | 5.52 |
| 44797.395833333336 | 5.14 |
| 44797.40625 | 5.15 |
| 44797.416666666664 | 5.12 |
| 44797.427083333336 | 5.57 |
| 44797.4375 | 5.2 |
| 44797.447916666664 | 3.93 |
| 44797.458333333336 | 4.08 |
| 44797.46875 | 3.92 |
| 44797.479166666664 | 3.85 |
| 44797.489583333336 | 3.52 |
| 44797.5 | 4.31 |
| 44797.510416666664 | 3.9 |
| 44797.520833333336 | 4.12 |
| 44797.53125 | 4.42 |
| 44797.541666666664 | 4.26 |
| 44797.552083333336 | 4.05 |
| 44797.5625 | 4.51 |
| 44797.572916666664 | 4.45 |
| 44797.583333333336 | 4.33 |
| 44797.59375 | 5.45 |
| 44797.604166666664 | 6.19 |
| 44797.614583333336 | 7.26 |
| 44797.625 | 9.35 |
| 44797.635416666664 | 8.55 |
| 44797.645833333336 | 10.36 |
| 44797.65625 | 11.67 |
| 44797.666666666664 | 13 |
| 44797.677083333336 | 15.91 |
| 44797.6875 | 15.92 |
| 44797.697916666664 | 22.75 |
| 44797.708333333336 | 29.22 |
| 44797.71875 | 49.29 |
| 44797.729166666664 | 53.63 |
| 44797.739583333336 | 52.38 |
| 44797.75 | 32.25 |
| 44797.760416666664 | 28.06 |
| 44797.770833333336 | 22.36 |
| 44797.78125 | 21.85 |
| 44797.791666666664 | 16.96 |
| 44797.802083333336 | 14.04 |
| 44797.8125 | 12.09 |
| 44797.822916666664 | 10.75 |
| 44797.833333333336 | 9.91 |
| 44797.84375 | 9.69 |
| 44797.854166666664 | 8.9 |
| 44797.864583333336 | 8.03 |
| 44797.875 | 7.68 |
| 44797.885416666664 | 7.78 |
| 44797.895833333336 | 7.98 |
| 44797.90625 | 8.29 |
| 44797.916666666664 | 8.43 |
| 44797.927083333336 | 9.09 |
| 44797.9375 | 9.4 |
| 44797.947916666664 | 9.27 |
| 44797.958333333336 | 10.81 |
| 44797.96875 | 11.51 |
| 44797.979166666664 | 12.44 |
| 44797.989583333336 | 15.06 |
| 44798.0 | 15.41 |
| 44798.010416666664 | 14.16 |
| 44798.020833333336 | 12.33 |
| 44798.03125 | 14.05 |
| 44798.041666666664 | 12.76 |
| 44798.052083333336 | 10.67 |
| 44798.0625 | 10.01 |
| 44798.072916666664 | 9.6 |
| 44798.083333333336 | 10.73 |
| 44798.09375 | 9.08 |
| 44798.104166666664 | 8.55 |
| 44798.114583333336 | 8.58 |
| 44798.125 | 9.48 |
| 44798.135416666664 | 8.91 |
| 44798.145833333336 | 8.82 |
| 44798.15625 | 9.49 |
| 44798.166666666664 | 9.93 |
| 44798.177083333336 | 10.29 |
| 44798.1875 | 12.34 |
| 44798.197916666664 | 12.51 |
| 44798.208333333336 | 14.14 |
| 44798.21875 | 14.23 |
| 44798.229166666664 | 14.41 |
| 44798.239583333336 | 14.8 |
| 44798.25 | 15.72 |
| 44798.260416666664 | 18.47 |
| 44798.270833333336 | 15.14 |
| 44798.28125 | 12.66 |
| 44798.291666666664 | 13.9 |
| 44798.302083333336 | 13.16 |
| 44798.3125 | 12.36 |
| 44798.322916666664 | 10.95 |
| 44798.333333333336 | 10.13 |
| 44798.34375 | 9.57 |
| 44798.354166666664 | 8.3 |
| 44798.364583333336 | 7.63 |
| 44798.375 | 6.81 |
| 44798.385416666664 | 6.38 |
| 44798.395833333336 | 6.04 |
| 44798.40625 | 6.27 |
| 44798.416666666664 | 5.47 |
| 44798.427083333336 | 5.81 |
| 44798.4375 | 5.07 |
| 44798.447916666664 | 5.21 |
| 44798.458333333336 | 4.56 |
| 44798.46875 | 4.52 |
| 44798.479166666664 | 4.48 |
| 44798.489583333336 | 4.59 |
| 44798.5 | 4.56 |
| 44798.510416666664 | 3.9 |
| 44798.520833333336 | 3.61 |
| 44798.53125 | 4 |
| 44798.541666666664 | 2.6 |
| 44798.552083333336 | 4.05 |
| 44798.5625 | 4.15 |
| 44798.572916666664 | 4.6 |
| 44798.583333333336 | 5.09 |
| 44798.59375 | 3.67 |
| 44798.604166666664 | 4.11 |
| 44798.614583333336 | 5.51 |
| 44798.625 | 4.82 |
| 44798.635416666664 | 6.55 |
| 44798.645833333336 | 6.27 |
| 44798.65625 | 6.44 |
| 44798.666666666664 | 9.21 |
| 44798.677083333336 | 12.1 |
| 44798.6875 | 13.29 |
| 44798.697916666664 | 19.56 |
| 44798.708333333336 | 31.36 |
| 44798.71875 | 44.65 |
| 44798.729166666664 | 54.36 |
| 44798.739583333336 | 63.59 |
| 44798.75 | 68.3 |
| 44798.760416666664 | 77.93 |
| 44798.770833333336 | 77.43 |
| 44798.78125 | 57.89 |
| 44798.791666666664 | 56.61 |
| 44798.802083333336 | 44.51 |
| 44798.8125 | 35.98 |
| 44798.822916666664 | 28.39 |
| 44798.833333333336 | 22.6 |
| 44798.84375 | 17.85 |
| 44798.854166666664 | 13.54 |
| 44798.864583333336 | 12.85 |
| 44798.875 | 11.9 |
| 44798.885416666664 | 11.69 |
| 44798.895833333336 | 10.51 |
| 44798.90625 | 10.65 |
| 44798.916666666664 | 10.76 |
| 44798.927083333336 | 10.94 |
| 44798.9375 | 11.78 |
| 44798.947916666664 | 11.51 |
| 44798.958333333336 | 13.93 |
| 44798.96875 | 14.14 |
| 44798.979166666664 | 13.62 |
| 44798.989583333336 | 15.15 |
| 44799.0 | 13.96 |
| 44799.010416666664 | 14.31 |
| 44799.020833333336 | 13.96 |
| 44799.03125 | 12.64 |
| 44799.041666666664 | 11.65 |
| 44799.052083333336 | 12.16 |
| 44799.0625 | 11.84 |
| 44799.072916666664 | 11.16 |
| 44799.083333333336 | 11.27 |
| 44799.09375 | 10.22 |
| 44799.104166666664 | 10.48 |
| 44799.114583333336 | 10.18 |
| 44799.125 | 9.11 |
| 44799.135416666664 | 9.08 |
| 44799.145833333336 | 9.64 |
| 44799.15625 | 8.45 |
| 44799.166666666664 | 9.08 |
| 44799.177083333336 | 8.54 |
| 44799.1875 | 9.13 |
| 44799.197916666664 | 9.2 |
| 44799.208333333336 | 10.06 |
| 44799.21875 | 8.89 |
| 44799.229166666664 | 10.86 |
| 44799.239583333336 | 11.59 |
| 44799.25 | 10.63 |
| 44799.260416666664 | 11.99 |
| 44799.270833333336 | 12.25 |
| 44799.28125 | 13.3 |
| 44799.291666666664 | 14.86 |
| 44799.302083333336 | 11.67 |
| 44799.3125 | 9.65 |
| 44799.322916666664 | 10.42 |
| 44799.333333333336 | 10.77 |
| 44799.34375 | 9.49 |
| 44799.354166666664 | 8.83 |
| 44799.364583333336 | 8.54 |
| 44799.375 | 7.91 |
| 44799.385416666664 | 7.02 |
| 44799.395833333336 | 6.66 |
| 44799.40625 | 6.28 |
| 44799.416666666664 | 5.78 |
| 44799.427083333336 | 6.28 |
| 44799.4375 | 5.52 |
| 44799.447916666664 | 5.83 |
| 44799.458333333336 | 5.45 |
| 44799.46875 | 5.09 |
| 44799.479166666664 | 4.99 |
| 44799.489583333336 | 5.14 |
| 44799.5 | 5.07 |
| 44799.510416666664 | 4.76 |
| 44799.520833333336 | 4.93 |
| 44799.53125 | 4.42 |
| 44799.541666666664 | 4.5 |
| 44799.552083333336 | 5.11 |
| 44799.5625 | 4.32 |
| 44799.572916666664 | 5.23 |
| 44799.583333333336 | 4.78 |
| 44799.59375 | 4.27 |
| 44799.604166666664 | 5.08 |
| 44799.614583333336 | 5.74 |
| 44799.625 | 5.16 |
| 44799.635416666664 | 5.23 |
| 44799.645833333336 | 5.66 |
| 44799.65625 | 6.27 |
| 44799.666666666664 | 6.86 |
| 44799.677083333336 | 8.49 |
| 44799.6875 | 10.07 |
| 44799.697916666664 | 12.31 |
| 44799.708333333336 | 17.51 |
| 44799.71875 | 25.08 |
| 44799.729166666664 | 33.19 |
| 44799.739583333336 | 41.34 |
| 44799.75 | 46.01 |
| 44799.760416666664 | 55.52 |
| 44799.770833333336 | 60.28 |
| 44799.78125 | 67.64 |
| 44799.791666666664 | 53.19 |
| 44799.802083333336 | 36.44 |
| 44799.8125 | 49.62 |
| 44799.822916666664 | 49.69 |
| 44799.833333333336 | 39.24 |
| 44799.84375 | 30.03 |
| 44799.854166666664 | 24.3 |
| 44799.864583333336 | 19.51 |
| 44799.875 | 17.23 |
| 44799.885416666664 | 15.93 |
| 44799.895833333336 | 15.07 |
| 44799.90625 | 14.87 |
| 44799.916666666664 | 14.51 |
| 44799.927083333336 | 14.17 |
| 44799.9375 | 12.99 |
| 44799.947916666664 | 12.12 |
| 44799.958333333336 | 12.15 |
| 44799.96875 | 12.92 |
| 44799.979166666664 | 13.72 |
| 44799.989583333336 | 14.52 |
| 44800.0 | 13.68 |
| 44800.010416666664 | 16.01 |
| 44800.020833333336 | 13.94 |
| 44800.03125 | 13.49 |
| 44800.041666666664 | 11.46 |
| 44800.052083333336 | 13.34 |
| 44800.0625 | 12.54 |
| 44800.072916666664 | 10.62 |
| 44800.083333333336 | 9.51 |
| 44800.09375 | 10.3 |
| 44800.104166666664 | 10.17 |
| 44800.114583333336 | 10.11 |
| 44800.125 | 9.84 |
| 44800.135416666664 | 9.1 |
| 44800.145833333336 | 8.86 |
| 44800.15625 | 8.6 |
| 44800.166666666664 | 8.58 |
| 44800.177083333336 | 8.68 |
| 44800.1875 | 8.88 |
| 44800.197916666664 | 10.61 |
| 44800.208333333336 | 9.42 |
| 44800.21875 | 9.19 |
| 44800.229166666664 | 9.39 |
| 44800.239583333336 | 9.68 |
| 44800.25 | 10.27 |
| 44800.260416666664 | 10.07 |
| 44800.270833333336 | 9.17 |
| 44800.28125 | 10.15 |
| 44800.291666666664 | 10.55 |
| 44800.302083333336 | 11.67 |
| 44800.3125 | 11.89 |
| 44800.322916666664 | 9.2 |
| 44800.333333333336 | 9.3 |
| 44800.34375 | 9.85 |
| 44800.354166666664 | 9.25 |
| 44800.364583333336 | 8.85 |
| 44800.375 | 8.27 |
| 44800.385416666664 | 8.45 |
| 44800.395833333336 | 7.16 |
| 44800.40625 | 6.79 |
| 44800.416666666664 | 7.02 |
| 44800.427083333336 | 6.33 |
| 44800.4375 | 6.35 |
| 44800.447916666664 | 5.51 |
| 44800.458333333336 | 5.74 |
| 44800.46875 | 5.38 |
| 44800.479166666664 | 5.09 |
| 44800.489583333336 | 5.26 |
| 44800.5 | 5.2 |
| 44800.510416666664 | 5.26 |
| 44800.520833333336 | 4.82 |
| 44800.53125 | 5.06 |
| 44800.541666666664 | 4.92 |
| 44800.552083333336 | 4.85 |
| 44800.5625 | 4.91 |
| 44800.572916666664 | 5.05 |
| 44800.583333333336 | 7.31 |
| 44800.59375 | 4.66 |
| 44800.604166666664 | 4.14 |
| 44800.614583333336 | 5.22 |
| 44800.625 | 5.09 |
| 44800.635416666664 | 5.23 |
| 44800.645833333336 | 5.39 |
| 44800.65625 | 4.51 |
| 44800.666666666664 | 5.43 |
| 44800.677083333336 | 6.36 |
| 44800.6875 | 7.15 |
| 44800.697916666664 | 8.44 |
| 44800.708333333336 | 9.54 |
| 44800.71875 | 14.08 |
| 44800.729166666664 | 19.16 |
| 44800.739583333336 | 30.81 |
| 44800.75 | 32.95 |
| 44800.760416666664 | 44.63 |
| 44800.770833333336 | 46.15 |
| 44800.78125 | 57.91 |
| 44800.791666666664 | 71.7 |
| 44800.802083333336 | 77.12 |
| 44800.8125 | 79.07 |
| 44800.822916666664 | 47.15 |
| 44800.833333333336 | 64.83 |
| 44800.84375 | 59.08 |
| 44800.854166666664 | 66.22 |
| 44800.864583333336 | 59.64 |
| 44800.875 | 51.56 |
| 44800.885416666664 | 41.34 |
| 44800.895833333336 | 37.98 |
| 44800.90625 | 27.09 |
| 44800.916666666664 | 18.92 |
| 44800.927083333336 | 14.35 |
| 44800.9375 | 11.1 |
| 44800.947916666664 | 9.53 |
| 44800.958333333336 | 9.05 |
| 44800.96875 | 9.23 |
| 44800.979166666664 | 9.78 |
| 44800.989583333336 | 10.47 |
| 44801.0 | 10.89 |
| 44801.010416666664 | 11.74 |
| 44801.020833333336 | 13.07 |
| 44801.03125 | 9.95 |
| 44801.041666666664 | 9.9 |
| 44801.052083333336 | 9.52 |
| 44801.0625 | 9.52 |
| 44801.072916666664 | 10.63 |
| 44801.083333333336 | 17.04 |
| 44801.09375 | 10.31 |
| 44801.104166666664 | 7.93 |
| 44801.114583333336 | 8.61 |
| 44801.125 | 7.72 |
| 44801.135416666664 | 7.18 |
| 44801.145833333336 | 7.31 |
| 44801.15625 | 6.5 |
| 44801.166666666664 | 6.88 |
| 44801.177083333336 | 6.44 |
| 44801.1875 | 6.31 |
| 44801.197916666664 | 6.4 |
| 44801.208333333336 | 5.65 |
| 44801.21875 | 6.06 |
| 44801.229166666664 | 6.2 |
| 44801.239583333336 | 6.44 |
| 44801.25 | 6.37 |
| 44801.260416666664 | 6.91 |
| 44801.270833333336 | 7.09 |
| 44801.28125 | 6.61 |
| 44801.291666666664 | 7.67 |
| 44801.302083333336 | 7.59 |
| 44801.3125 | 7.99 |
| 44801.322916666664 | 9.1 |
| 44801.333333333336 | 10.3 |
| 44801.34375 | 8.77 |
| 44801.354166666664 | 7.3 |
| 44801.364583333336 | 7.44 |
| 44801.375 | 6.92 |
| 44801.385416666664 | 6.4 |
| 44801.395833333336 | 6.16 |
| 44801.40625 | 6.43 |
| 44801.416666666664 | 5.77 |
| 44801.427083333336 | 5.42 |
| 44801.4375 | 5.36 |
| 44801.447916666664 | 5.42 |
| 44801.458333333336 | 4.96 |
| 44801.46875 | 4.92 |
| 44801.479166666664 | 4.78 |
| 44801.489583333336 | 4.85 |
| 44801.5 | 4.66 |
| 44801.510416666664 | 4.89 |
| 44801.520833333336 | 4.76 |
| 44801.53125 | 4.72 |
| 44801.541666666664 | 4.74 |
| 44801.552083333336 | 4.7 |
| 44801.5625 | 4.33 |
| 44801.572916666664 | 4.14 |
| 44801.583333333336 | 4.05 |
| 44801.59375 | 3.8 |
| 44801.604166666664 | 4.57 |
| 44801.614583333336 | 4.31 |
| 44801.625 | 4.51 |
| 44801.635416666664 | 4.38 |
| 44801.645833333336 | 4.64 |
| 44801.65625 | 4.99 |
| 44801.666666666664 | 4.78 |
| 44801.677083333336 | 4.7 |
| 44801.6875 | 4.83 |
| 44801.697916666664 | 5.18 |
| 44801.708333333336 | 6.44 |
| 44801.71875 | 7.05 |
| 44801.729166666664 | 7.61 |
| 44801.739583333336 | 8.41 |
| 44801.75 | 10.19 |
| 44801.760416666664 | 11.74 |
| 44801.770833333336 | 15.23 |
| 44801.78125 | 21.2 |
| 44801.791666666664 | 27.38 |
| 44801.802083333336 | 30.15 |
| 44801.8125 | 34.01 |
| 44801.822916666664 | 31.5 |
| 44801.833333333336 | 47.44 |
| 44801.84375 | 54.31 |
| 44801.854166666664 | 51.07 |
| 44801.864583333336 | 39.79 |
| 44801.875 | 52.38 |
| 44801.885416666664 | 56.02 |
| 44801.895833333336 | 42.42 |
| 44801.90625 | 34.29 |
| 44801.916666666664 | 27.31 |
| 44801.927083333336 | 19.44 |
| 44801.9375 | 13.38 |
| 44801.947916666664 | 11.03 |
| 44801.958333333336 | 9.49 |
| 44801.96875 | 8.78 |
| 44801.979166666664 | 8.09 |
| 44801.989583333336 | 7.85 |
| 44802.0 | 9.43 |
| 44802.010416666664 | 8.52 |
| 44802.020833333336 | 8.09 |
| 44802.03125 | 8.71 |
| 44802.041666666664 | 9.24 |
| 44802.052083333336 | 9.04 |
| 44802.0625 | 8.91 |
| 44802.072916666664 | 8.65 |
| 44802.083333333336 | 8.97 |
| 44802.09375 | 7.32 |
| 44802.104166666664 | 6.51 |
| 44802.114583333336 | 7.37 |
| 44802.125 | 6.11 |
| 44802.135416666664 | 6.73 |
| 44802.145833333336 | 6.42 |
| 44802.15625 | 5.96 |
| 44802.166666666664 | 5.94 |
| 44802.177083333336 | 6.48 |
| 44802.1875 | 6.02 |
| 44802.197916666664 | 5.55 |
| 44802.208333333336 | 5.2 |
| 44802.21875 | 5.06 |
| 44802.229166666664 | 5.52 |
| 44802.239583333336 | 5.68 |
| 44802.25 | 5.26 |
| 44802.260416666664 | 5.72 |
| 44802.270833333336 | 5.95 |
| 44802.28125 | 6.17 |
| 44802.291666666664 | 6.04 |
| 44802.302083333336 | 6.38 |
| 44802.3125 | 6.97 |
| 44802.322916666664 | 6.93 |
| 44802.333333333336 | 7.36 |
| 44802.34375 | 7.27 |
| 44802.354166666664 | 9.08 |
| 44802.364583333336 | 9.17 |
| 44802.375 | 7.33 |
| 44802.385416666664 | 6.35 |
| 44802.395833333336 | 7.03 |
| 44802.40625 | 6.15 |
| 44802.416666666664 | 6.08 |
| 44802.427083333336 | 5.77 |
| 44802.4375 | 5.47 |
| 44802.447916666664 | 4.97 |
| 44802.458333333336 | 5.32 |
| 44802.46875 | 4.98 |
| 44802.479166666664 | 4.97 |
| 44802.489583333336 | 4.89 |
| 44802.5 | 5.24 |
| 44802.510416666664 | 5.38 |
| 44802.520833333336 | 5.03 |
| 44802.53125 | 4.89 |
| 44802.541666666664 | 4.67 |
| 44802.552083333336 | 4.48 |
| 44802.5625 | 4.59 |
| 44802.572916666664 | 4.39 |
| 44802.583333333336 | 4.72 |
| 44802.59375 | 3.81 |
| 44802.604166666664 | 4.05 |
| 44802.614583333336 | 4.53 |
| 44802.625 | 4.4 |
| 44802.635416666664 | 4.38 |
| 44802.645833333336 | 5.76 |
| 44802.65625 | 4.08 |
| 44802.666666666664 | 4.41 |
| 44802.677083333336 | 4.19 |
| 44802.6875 | 4.24 |
| 44802.697916666664 | 4.29 |
| 44802.708333333336 | 4.78 |
| 44802.71875 | 5.42 |
| 44802.729166666664 | 5.16 |
| 44802.739583333336 | 6.04 |
| 44802.75 | 6.91 |
| 44802.760416666664 | 8.21 |
| 44802.770833333336 | 7.72 |
| 44802.78125 | 9.08 |
| 44802.791666666664 | 11.21 |
| 44802.802083333336 | 12.71 |
| 44802.8125 | 18.22 |
| 44802.822916666664 | 19.8 |
| 44802.833333333336 | 28.4 |
| 44802.84375 | 28.47 |
| 44802.854166666664 | 43.02 |
| 44802.864583333336 | 49.86 |
| 44802.875 | 58.38 |
| 44802.885416666664 | 48.51 |
| 44802.895833333336 | 48.69 |
| 44802.90625 | 49.75 |
| 44802.916666666664 | 40.55 |
| 44802.927083333336 | 28.06 |
| 44802.9375 | 21.41 |
| 44802.947916666664 | 17.55 |
| 44802.958333333336 | 13.63 |
| 44802.96875 | 10.14 |
| 44802.979166666664 | 9.92 |
| 44802.989583333336 | 9.65 |
| 44803.0 | 8.7 |
| 44803.010416666664 | 8.03 |
| 44803.020833333336 | 7.93 |
| 44803.03125 | 6.98 |
| 44803.041666666664 | 135.57 |
| 44803.052083333336 | 7.23 |
| 44803.0625 | 7.49 |
| 44803.072916666664 | 8.53 |
| 44803.083333333336 | 3.78 |
| 44803.09375 | 7.65 |
| 44803.104166666664 | 7.26 |
| 44803.114583333336 | 8.04 |
| 44803.125 | 7 |
| 44803.135416666664 | 6.57 |
| 44803.145833333336 | 6.3 |
| 44803.15625 | 5.14 |
| 44803.166666666664 | 5.76 |
| 44803.177083333336 | 5.82 |
| 44803.1875 | 5.38 |
| 44803.197916666664 | 5.02 |
| 44803.208333333336 | 4.92 |
| 44803.21875 | 4.64 |
| 44803.229166666664 | 4.91 |
| 44803.239583333336 | 5 |
| 44803.25 | 4.64 |
| 44803.260416666664 | 4.87 |
| 44803.270833333336 | 4.81 |
| 44803.28125 | 5.22 |
| 44803.291666666664 | 5.52 |
| 44803.302083333336 | 5.72 |
| 44803.3125 | 5.99 |
| 44803.322916666664 | 6.51 |
| 44803.333333333336 | 5.8 |
| 44803.34375 | 6.28 |
| 44803.354166666664 | 15.65 |
| 44803.364583333336 | 8.3 |
| 44803.375 | 7.8 |
| 44803.385416666664 | 8.04 |
| 44803.395833333336 | 7.45 |
| 44803.40625 | 6.81 |
| 44803.416666666664 | 6.46 |
| 44803.427083333336 | 6.78 |
| 44803.4375 | 6.56 |
| 44803.447916666664 | 7.29 |
| 44803.458333333336 | 6.22 |
| 44803.46875 | 6.71 |
| 44803.479166666664 | 6.14 |
| 44803.489583333336 | 5.97 |
| 44803.5 | 5.85 |
| 44803.510416666664 | 5.82 |
| 44803.520833333336 | 5.88 |
| 44803.53125 | 5.44 |
| 44803.541666666664 | 5.6 |
| 44803.552083333336 | 5.55 |
| 44803.5625 | 4.91 |
| 44803.572916666664 | 4.42 |
| 44803.583333333336 | 4.67 |
| 44803.59375 | 5.03 |
| 44803.604166666664 | 4.36 |
| 44803.614583333336 | 4.22 |
| 44803.625 | 4.31 |
| 44803.635416666664 | 5.77 |
| 44803.645833333336 | 4.9 |
| 44803.65625 | 5.91 |
| 44803.666666666664 | 5.12 |
| 44803.677083333336 | 5.84 |
| 44803.6875 | 5.15 |
| 44803.697916666664 | 4.84 |
| 44803.708333333336 | 4.61 |
| 44803.71875 | 5.62 |
| 44803.729166666664 | 5.35 |
| 44803.739583333336 | 5.12 |
| 44803.75 | 5.12 |
| 44803.760416666664 | 5.84 |
| 44803.770833333336 | 5.62 |
| 44803.78125 | 6.49 |
| 44803.791666666664 | 7.51 |
| 44803.802083333336 | 8.81 |
| 44803.8125 | 9.03 |
| 44803.822916666664 | 10.17 |
| 44803.833333333336 | 11.78 |
| 44803.84375 | 14.6 |
| 44803.854166666664 | 19.08 |
| 44803.864583333336 | 20.47 |
| 44803.875 | 22.89 |
| 44803.885416666664 | 25.96 |
| 44803.895833333336 | 27.99 |
| 44803.90625 | 22.01 |
| 44803.916666666664 | 18.41 |
| 44803.927083333336 | 16.05 |
| 44803.9375 | 16.34 |
| 44803.947916666664 | 13.54 |
| 44803.958333333336 | 11.78 |
| 44803.96875 | 11.68 |
| 44803.979166666664 | 13.04 |
| 44803.989583333336 | 12.01 |
| 44804.0 | 12.68 |
| 44804.010416666664 | 12.95 |
| 44804.020833333336 | 13.71 |
| 44804.03125 | 13.21 |
| 44804.041666666664 | 12.35 |
| 44804.052083333336 | 13.25 |
| 44804.0625 | 12.66 |
| 44804.072916666664 | 12.01 |
| 44804.083333333336 | 12.71 |
| 44804.09375 | 11.06 |
| 44804.104166666664 | 13.38 |
| 44804.114583333336 | 11.33 |
| 44804.125 | 11.05 |
| 44804.135416666664 | 11.19 |
| 44804.145833333336 | 10.75 |
| 44804.15625 | 11.96 |
| 44804.166666666664 | 8.91 |
| 44804.177083333336 | 12.96 |
| 44804.1875 | 13.26 |
| 44804.197916666664 | 9.78 |
| 44804.208333333336 | 8.21 |
| 44804.21875 | 8.08 |
| 44804.229166666664 | 8.91 |
| 44804.239583333336 | 8.72 |
| 44804.25 | 6.11 |
| 44804.260416666664 | 7.45 |
| 44804.270833333336 | 7.19 |
| 44804.28125 | 7.17 |
| 44804.291666666664 | 8.94 |
| 44804.302083333336 | 7.48 |
| 44804.3125 | 7.76 |
| 44804.322916666664 | 8.21 |
| 44804.333333333336 | 8.18 |
| 44804.34375 | 8.31 |
| 44804.354166666664 | 8.36 |
| 44804.364583333336 | 8.83 |
| 44804.375 | 8.86 |
| 44804.385416666664 | 9.06 |
| 44804.395833333336 | 10.11 |
| 44804.40625 | 9.57 |
| 44804.416666666664 | 10.67 |
| 44804.427083333336 | 8.74 |
| 44804.4375 | 7.7 |
| 44804.447916666664 | 7.77 |
| 44804.458333333336 | 8.24 |
| 44804.46875 | 7.86 |
| 44804.479166666664 | 8.04 |
| 44804.489583333336 | 7.36 |
| 44804.5 | 7.23 |
| 44804.510416666664 | 7.37 |
| 44804.520833333336 | 6.93 |
| 44804.53125 | 6.75 |
| 44804.541666666664 | 6.46 |
| 44804.552083333336 | 6.45 |
| 44804.5625 | 6.45 |
| 44804.572916666664 | 6.45 |
| 44804.583333333336 | 6.35 |
| 44804.59375 | 6.14 |
| 44804.604166666664 | 6.54 |
| 44804.614583333336 | 5.77 |
| 44804.625 | 6.37 |
| 44804.635416666664 | 6.04 |
| 44804.645833333336 | 6.06 |
| 44804.65625 | 5.94 |
| 44804.666666666664 | 6.35 |
| 44804.677083333336 | 6.12 |
| 44804.6875 | 6.26 |
| 44804.697916666664 | 6.64 |
| 44804.708333333336 | 6.86 |
| 44804.71875 | 6.68 |
| 44804.729166666664 | 6.51 |
| 44804.739583333336 | 7.38 |
| 44804.75 | 7.6 |
| 44804.760416666664 | 7.18 |
| 44804.770833333336 | 8.33 |
| 44804.78125 | 8.48 |
| 44804.791666666664 | 7.76 |
| 44804.802083333336 | 8.9 |
| 44804.8125 | 9.26 |
| 44804.822916666664 | 9.93 |
| 44804.833333333336 | 10.63 |
| 44804.84375 | 13.49 |
| 44804.854166666664 | 14.8 |
| 44804.864583333336 | 14.6 |
| 44804.875 | 15.6 |
| 44804.885416666664 | 16.42 |
| 44804.895833333336 | 16.19 |
| 44804.90625 | 17.49 |
| 44804.916666666664 | 17.38 |
| 44804.927083333336 | 22.43 |
| 44804.9375 | 14.79 |
| 44804.947916666664 | 16.45 |
| 44804.958333333336 | 17.14 |
| 44804.96875 | 15.9 |
| 44804.979166666664 | 16.28 |
| 44804.989583333336 | 15.76 |
| 44805.0 | 17 |
| 44805.010416666664 | 15.5 |
| 44805.020833333336 | 14.9 |
| 44805.03125 | 12.67 |
| 44805.041666666664 | 10.82 |
| 44805.052083333336 | 12.64 |
| 44805.0625 | 11.43 |
| 44805.072916666664 | 10 |
| 44805.083333333336 | 9.93 |
| 44805.09375 | 10.32 |
| 44805.104166666664 | 9.21 |
| 44805.114583333336 | 9.69 |
| 44805.125 | 10.37 |
| 44805.135416666664 | 10.6 |
| 44805.145833333336 | 8.03 |